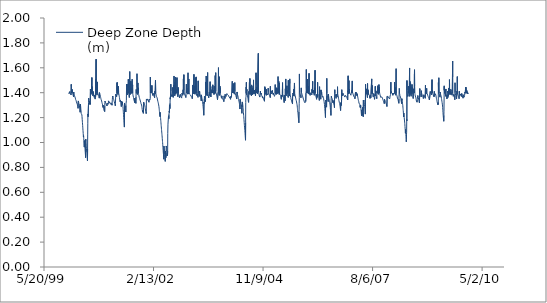
| Category | Deep Zone Depth (m) |
|---|---|
| 36526.0 | 1.4 |
| 36527.0 | 1.397 |
| 36528.0 | 1.395 |
| 36529.0 | 1.392 |
| 36530.0 | 1.391 |
| 36531.0 | 1.389 |
| 36532.0 | 1.387 |
| 36533.0 | 1.395 |
| 36534.0 | 1.393 |
| 36535.0 | 1.39 |
| 36536.0 | 1.409 |
| 36537.0 | 1.401 |
| 36538.0 | 1.398 |
| 36539.0 | 1.398 |
| 36540.0 | 1.395 |
| 36541.0 | 1.393 |
| 36542.0 | 1.391 |
| 36543.0 | 1.389 |
| 36544.0 | 1.386 |
| 36545.0 | 1.386 |
| 36546.0 | 1.384 |
| 36547.0 | 1.382 |
| 36548.0 | 1.38 |
| 36549.0 | 1.467 |
| 36550.0 | 1.449 |
| 36551.0 | 1.409 |
| 36552.0 | 1.408 |
| 36553.0 | 1.401 |
| 36554.0 | 1.417 |
| 36555.0 | 1.399 |
| 36556.0 | 1.428 |
| 36557.0 | 1.405 |
| 36558.0 | 1.4 |
| 36559.0 | 1.398 |
| 36560.0 | 1.395 |
| 36561.0 | 1.392 |
| 36562.0 | 1.39 |
| 36563.0 | 1.387 |
| 36564.0 | 1.384 |
| 36565.0 | 1.382 |
| 36566.0 | 1.379 |
| 36567.0 | 1.376 |
| 36568.0 | 1.373 |
| 36569.0 | 1.37 |
| 36570.0 | 1.367 |
| 36571.0 | 1.405 |
| 36572.0 | 1.399 |
| 36573.0 | 1.395 |
| 36574.0 | 1.392 |
| 36575.0 | 1.388 |
| 36576.0 | 1.385 |
| 36577.0 | 1.382 |
| 36578.0 | 1.379 |
| 36579.0 | 1.376 |
| 36580.0 | 1.373 |
| 36581.0 | 1.37 |
| 36582.0 | 1.366 |
| 36583.0 | 1.363 |
| 36584.0 | 1.364 |
| 36585.0 | 1.361 |
| 36586.0 | 1.357 |
| 36587.0 | 1.353 |
| 36588.0 | 1.349 |
| 36589.0 | 1.345 |
| 36590.0 | 1.352 |
| 36591.0 | 1.349 |
| 36592.0 | 1.344 |
| 36593.0 | 1.34 |
| 36594.0 | 1.335 |
| 36595.0 | 1.331 |
| 36596.0 | 1.327 |
| 36597.0 | 1.324 |
| 36598.0 | 1.324 |
| 36599.0 | 1.32 |
| 36600.0 | 1.316 |
| 36601.0 | 1.311 |
| 36602.0 | 1.313 |
| 36603.0 | 1.309 |
| 36604.0 | 1.307 |
| 36605.0 | 1.309 |
| 36606.0 | 1.308 |
| 36607.0 | 1.304 |
| 36608.0 | 1.299 |
| 36609.0 | 1.292 |
| 36610.0 | 1.284 |
| 36611.0 | 1.274 |
| 36612.0 | 1.322 |
| 36613.0 | 1.334 |
| 36614.0 | 1.332 |
| 36615.0 | 1.327 |
| 36616.0 | 1.324 |
| 36617.0 | 1.32 |
| 36618.0 | 1.316 |
| 36619.0 | 1.311 |
| 36620.0 | 1.307 |
| 36621.0 | 1.307 |
| 36622.0 | 1.302 |
| 36623.0 | 1.295 |
| 36624.0 | 1.284 |
| 36625.0 | 1.294 |
| 36626.0 | 1.286 |
| 36627.0 | 1.275 |
| 36628.0 | 1.264 |
| 36629.0 | 1.254 |
| 36630.0 | 1.243 |
| 36631.0 | 1.309 |
| 36632.0 | 1.308 |
| 36633.0 | 1.302 |
| 36634.0 | 1.295 |
| 36635.0 | 1.285 |
| 36636.0 | 1.274 |
| 36637.0 | 1.263 |
| 36638.0 | 1.253 |
| 36639.0 | 1.244 |
| 36640.0 | 1.233 |
| 36641.0 | 1.24 |
| 36642.0 | 1.231 |
| 36643.0 | 1.239 |
| 36644.0 | 1.228 |
| 36645.0 | 1.232 |
| 36646.0 | 1.222 |
| 36647.0 | 1.21 |
| 36648.0 | 1.197 |
| 36649.0 | 1.184 |
| 36650.0 | 1.172 |
| 36651.0 | 1.16 |
| 36652.0 | 1.148 |
| 36653.0 | 1.136 |
| 36654.0 | 1.123 |
| 36655.0 | 1.109 |
| 36656.0 | 1.096 |
| 36657.0 | 1.085 |
| 36658.0 | 1.072 |
| 36659.0 | 1.059 |
| 36660.0 | 1.046 |
| 36661.0 | 1.055 |
| 36662.0 | 1.042 |
| 36663.0 | 1.031 |
| 36664.0 | 1.017 |
| 36665.0 | 1.004 |
| 36666.0 | 0.989 |
| 36667.0 | 0.976 |
| 36668.0 | 0.963 |
| 36669.0 | 1.015 |
| 36670.0 | 1.003 |
| 36671.0 | 0.992 |
| 36672.0 | 0.98 |
| 36673.0 | 0.968 |
| 36674.0 | 0.954 |
| 36675.0 | 0.941 |
| 36676.0 | 0.93 |
| 36677.0 | 0.919 |
| 36678.0 | 0.907 |
| 36679.0 | 0.892 |
| 36680.0 | 0.878 |
| 36681.0 | 1.027 |
| 36682.0 | 1.013 |
| 36683.0 | 1 |
| 36684.0 | 0.99 |
| 36685.0 | 0.978 |
| 36686.0 | 0.965 |
| 36687.0 | 0.952 |
| 36688.0 | 0.939 |
| 36689.0 | 0.935 |
| 36690.0 | 0.933 |
| 36691.0 | 0.922 |
| 36692.0 | 0.911 |
| 36693.0 | 0.9 |
| 36694.0 | 0.888 |
| 36695.0 | 0.878 |
| 36696.0 | 0.867 |
| 36697.0 | 0.853 |
| 36698.0 | 0.948 |
| 36699.0 | 1.068 |
| 36700.0 | 1.155 |
| 36701.0 | 1.229 |
| 36702.0 | 1.219 |
| 36703.0 | 1.207 |
| 36704.0 | 1.199 |
| 36705.0 | 1.21 |
| 36706.0 | 1.3 |
| 36707.0 | 1.321 |
| 36708.0 | 1.356 |
| 36709.0 | 1.35 |
| 36710.0 | 1.344 |
| 36711.0 | 1.338 |
| 36712.0 | 1.332 |
| 36713.0 | 1.325 |
| 36714.0 | 1.318 |
| 36715.0 | 1.331 |
| 36716.0 | 1.325 |
| 36717.0 | 1.319 |
| 36718.0 | 1.312 |
| 36719.0 | 1.305 |
| 36720.0 | 1.316 |
| 36721.0 | 1.311 |
| 36722.0 | 1.307 |
| 36723.0 | 1.304 |
| 36724.0 | 1.429 |
| 36725.0 | 1.396 |
| 36726.0 | 1.39 |
| 36727.0 | 1.383 |
| 36728.0 | 1.391 |
| 36729.0 | 1.387 |
| 36730.0 | 1.419 |
| 36731.0 | 1.4 |
| 36732.0 | 1.398 |
| 36733.0 | 1.416 |
| 36734.0 | 1.396 |
| 36735.0 | 1.402 |
| 36736.0 | 1.397 |
| 36737.0 | 1.522 |
| 36738.0 | 1.395 |
| 36739.0 | 1.4 |
| 36740.0 | 1.449 |
| 36741.0 | 1.395 |
| 36742.0 | 1.399 |
| 36743.0 | 1.396 |
| 36744.0 | 1.39 |
| 36745.0 | 1.386 |
| 36746.0 | 1.38 |
| 36747.0 | 1.374 |
| 36748.0 | 1.394 |
| 36749.0 | 1.389 |
| 36750.0 | 1.384 |
| 36751.0 | 1.408 |
| 36752.0 | 1.397 |
| 36753.0 | 1.392 |
| 36754.0 | 1.385 |
| 36755.0 | 1.379 |
| 36756.0 | 1.373 |
| 36757.0 | 1.367 |
| 36758.0 | 1.368 |
| 36759.0 | 1.363 |
| 36760.0 | 1.358 |
| 36761.0 | 1.38 |
| 36762.0 | 1.374 |
| 36763.0 | 1.368 |
| 36764.0 | 1.366 |
| 36765.0 | 1.36 |
| 36766.0 | 1.354 |
| 36767.0 | 1.349 |
| 36768.0 | 1.378 |
| 36769.0 | 1.376 |
| 36770.0 | 1.37 |
| 36771.0 | 1.369 |
| 36772.0 | 1.508 |
| 36773.0 | 1.407 |
| 36774.0 | 1.4 |
| 36775.0 | 1.404 |
| 36776.0 | 1.669 |
| 36777.0 | 1.396 |
| 36778.0 | 1.404 |
| 36779.0 | 1.408 |
| 36780.0 | 1.399 |
| 36781.0 | 1.395 |
| 36782.0 | 1.39 |
| 36783.0 | 1.385 |
| 36784.0 | 1.38 |
| 36785.0 | 1.378 |
| 36786.0 | 1.383 |
| 36787.0 | 1.487 |
| 36788.0 | 1.398 |
| 36789.0 | 1.394 |
| 36790.0 | 1.4 |
| 36791.0 | 1.396 |
| 36792.0 | 1.394 |
| 36793.0 | 1.391 |
| 36794.0 | 1.388 |
| 36795.0 | 1.388 |
| 36796.0 | 1.385 |
| 36797.0 | 1.382 |
| 36798.0 | 1.378 |
| 36799.0 | 1.379 |
| 36800.0 | 1.375 |
| 36801.0 | 1.372 |
| 36802.0 | 1.368 |
| 36803.0 | 1.364 |
| 36804.0 | 1.36 |
| 36805.0 | 1.356 |
| 36806.0 | 1.401 |
| 36807.0 | 1.398 |
| 36808.0 | 1.395 |
| 36809.0 | 1.392 |
| 36810.0 | 1.389 |
| 36811.0 | 1.386 |
| 36812.0 | 1.382 |
| 36813.0 | 1.379 |
| 36814.0 | 1.375 |
| 36815.0 | 1.371 |
| 36816.0 | 1.367 |
| 36817.0 | 1.363 |
| 36818.0 | 1.359 |
| 36819.0 | 1.355 |
| 36820.0 | 1.352 |
| 36821.0 | 1.349 |
| 36822.0 | 1.345 |
| 36823.0 | 1.342 |
| 36824.0 | 1.341 |
| 36825.0 | 1.337 |
| 36826.0 | 1.334 |
| 36827.0 | 1.33 |
| 36828.0 | 1.326 |
| 36829.0 | 1.322 |
| 36830.0 | 1.319 |
| 36831.0 | 1.315 |
| 36832.0 | 1.312 |
| 36833.0 | 1.309 |
| 36834.0 | 1.306 |
| 36835.0 | 1.302 |
| 36836.0 | 1.299 |
| 36837.0 | 1.293 |
| 36838.0 | 1.287 |
| 36839.0 | 1.282 |
| 36840.0 | 1.299 |
| 36841.0 | 1.295 |
| 36842.0 | 1.29 |
| 36843.0 | 1.284 |
| 36844.0 | 1.278 |
| 36845.0 | 1.274 |
| 36846.0 | 1.269 |
| 36847.0 | 1.263 |
| 36848.0 | 1.258 |
| 36849.0 | 1.255 |
| 36850.0 | 1.263 |
| 36851.0 | 1.26 |
| 36852.0 | 1.257 |
| 36853.0 | 1.253 |
| 36854.0 | 1.248 |
| 36855.0 | 1.293 |
| 36856.0 | 1.323 |
| 36857.0 | 1.332 |
| 36858.0 | 1.33 |
| 36859.0 | 1.327 |
| 36860.0 | 1.325 |
| 36861.0 | 1.323 |
| 36862.0 | 1.32 |
| 36863.0 | 1.318 |
| 36864.0 | 1.316 |
| 36865.0 | 1.315 |
| 36866.0 | 1.313 |
| 36867.0 | 1.311 |
| 36868.0 | 1.309 |
| 36869.0 | 1.306 |
| 36870.0 | 1.304 |
| 36871.0 | 1.302 |
| 36872.0 | 1.304 |
| 36873.0 | 1.302 |
| 36874.0 | 1.298 |
| 36875.0 | 1.294 |
| 36876.0 | 1.289 |
| 36877.0 | 1.316 |
| 36878.0 | 1.319 |
| 36879.0 | 1.318 |
| 36880.0 | 1.319 |
| 36881.0 | 1.318 |
| 36882.0 | 1.316 |
| 36883.0 | 1.314 |
| 36884.0 | 1.312 |
| 36885.0 | 1.311 |
| 36886.0 | 1.309 |
| 36887.0 | 1.307 |
| 36888.0 | 1.305 |
| 36889.0 | 1.335 |
| 36890.0 | 1.333 |
| 36891.0 | 1.332 |
| 36892.0 | 1.331 |
| 36893.0 | 1.33 |
| 36894.0 | 1.328 |
| 36895.0 | 1.327 |
| 36896.0 | 1.325 |
| 36897.0 | 1.323 |
| 36898.0 | 1.321 |
| 36899.0 | 1.319 |
| 36900.0 | 1.319 |
| 36901.0 | 1.318 |
| 36902.0 | 1.316 |
| 36903.0 | 1.316 |
| 36904.0 | 1.321 |
| 36905.0 | 1.319 |
| 36906.0 | 1.317 |
| 36907.0 | 1.314 |
| 36908.0 | 1.311 |
| 36909.0 | 1.309 |
| 36910.0 | 1.307 |
| 36911.0 | 1.304 |
| 36912.0 | 1.319 |
| 36913.0 | 1.318 |
| 36914.0 | 1.316 |
| 36915.0 | 1.314 |
| 36916.0 | 1.312 |
| 36917.0 | 1.31 |
| 36918.0 | 1.308 |
| 36919.0 | 1.305 |
| 36920.0 | 1.302 |
| 36921.0 | 1.299 |
| 36922.0 | 1.314 |
| 36923.0 | 1.334 |
| 36924.0 | 1.343 |
| 36925.0 | 1.359 |
| 36926.0 | 1.357 |
| 36927.0 | 1.373 |
| 36928.0 | 1.371 |
| 36929.0 | 1.368 |
| 36930.0 | 1.365 |
| 36931.0 | 1.361 |
| 36932.0 | 1.358 |
| 36933.0 | 1.355 |
| 36934.0 | 1.352 |
| 36935.0 | 1.349 |
| 36936.0 | 1.346 |
| 36937.0 | 1.343 |
| 36938.0 | 1.34 |
| 36939.0 | 1.336 |
| 36940.0 | 1.333 |
| 36941.0 | 1.33 |
| 36942.0 | 1.327 |
| 36943.0 | 1.323 |
| 36944.0 | 1.319 |
| 36945.0 | 1.316 |
| 36946.0 | 1.314 |
| 36947.0 | 1.311 |
| 36948.0 | 1.308 |
| 36949.0 | 1.305 |
| 36950.0 | 1.301 |
| 36951.0 | 1.295 |
| 36952.0 | 1.312 |
| 36953.0 | 1.309 |
| 36954.0 | 1.306 |
| 36955.0 | 1.388 |
| 36956.0 | 1.385 |
| 36957.0 | 1.382 |
| 36958.0 | 1.379 |
| 36959.0 | 1.375 |
| 36960.0 | 1.38 |
| 36961.0 | 1.377 |
| 36962.0 | 1.373 |
| 36963.0 | 1.368 |
| 36964.0 | 1.385 |
| 36965.0 | 1.381 |
| 36966.0 | 1.481 |
| 36967.0 | 1.415 |
| 36968.0 | 1.398 |
| 36969.0 | 1.448 |
| 36970.0 | 1.482 |
| 36971.0 | 1.425 |
| 36972.0 | 1.398 |
| 36973.0 | 1.394 |
| 36974.0 | 1.39 |
| 36975.0 | 1.386 |
| 36976.0 | 1.413 |
| 36977.0 | 1.398 |
| 36978.0 | 1.395 |
| 36979.0 | 1.392 |
| 36980.0 | 1.451 |
| 36981.0 | 1.399 |
| 36982.0 | 1.395 |
| 36983.0 | 1.391 |
| 36984.0 | 1.386 |
| 36985.0 | 1.38 |
| 36986.0 | 1.376 |
| 36987.0 | 1.372 |
| 36988.0 | 1.366 |
| 36989.0 | 1.361 |
| 36990.0 | 1.355 |
| 36991.0 | 1.35 |
| 36992.0 | 1.345 |
| 36993.0 | 1.339 |
| 36994.0 | 1.333 |
| 36995.0 | 1.328 |
| 36996.0 | 1.33 |
| 36997.0 | 1.338 |
| 36998.0 | 1.334 |
| 36999.0 | 1.329 |
| 37000.0 | 1.326 |
| 37001.0 | 1.321 |
| 37002.0 | 1.316 |
| 37003.0 | 1.311 |
| 37004.0 | 1.305 |
| 37005.0 | 1.299 |
| 37006.0 | 1.288 |
| 37007.0 | 1.333 |
| 37008.0 | 1.329 |
| 37009.0 | 1.324 |
| 37010.0 | 1.318 |
| 37011.0 | 1.313 |
| 37012.0 | 1.309 |
| 37013.0 | 1.304 |
| 37014.0 | 1.327 |
| 37015.0 | 1.322 |
| 37016.0 | 1.317 |
| 37017.0 | 1.311 |
| 37018.0 | 1.305 |
| 37019.0 | 1.303 |
| 37020.0 | 1.297 |
| 37021.0 | 1.287 |
| 37022.0 | 1.276 |
| 37023.0 | 1.263 |
| 37024.0 | 1.252 |
| 37025.0 | 1.239 |
| 37026.0 | 1.226 |
| 37027.0 | 1.214 |
| 37028.0 | 1.2 |
| 37029.0 | 1.188 |
| 37030.0 | 1.175 |
| 37031.0 | 1.162 |
| 37032.0 | 1.151 |
| 37033.0 | 1.137 |
| 37034.0 | 1.124 |
| 37035.0 | 1.317 |
| 37036.0 | 1.31 |
| 37037.0 | 1.303 |
| 37038.0 | 1.293 |
| 37039.0 | 1.279 |
| 37040.0 | 1.275 |
| 37041.0 | 1.276 |
| 37042.0 | 1.293 |
| 37043.0 | 1.281 |
| 37044.0 | 1.282 |
| 37045.0 | 1.271 |
| 37046.0 | 1.258 |
| 37047.0 | 1.245 |
| 37048.0 | 1.299 |
| 37049.0 | 1.311 |
| 37050.0 | 1.306 |
| 37051.0 | 1.305 |
| 37052.0 | 1.336 |
| 37053.0 | 1.409 |
| 37054.0 | 1.443 |
| 37055.0 | 1.47 |
| 37056.0 | 1.395 |
| 37057.0 | 1.422 |
| 37058.0 | 1.394 |
| 37059.0 | 1.388 |
| 37060.0 | 1.381 |
| 37061.0 | 1.386 |
| 37062.0 | 1.379 |
| 37063.0 | 1.379 |
| 37064.0 | 1.376 |
| 37065.0 | 1.417 |
| 37066.0 | 1.469 |
| 37067.0 | 1.395 |
| 37068.0 | 1.389 |
| 37069.0 | 1.401 |
| 37070.0 | 1.507 |
| 37071.0 | 1.491 |
| 37072.0 | 1.433 |
| 37073.0 | 1.395 |
| 37074.0 | 1.39 |
| 37075.0 | 1.384 |
| 37076.0 | 1.378 |
| 37077.0 | 1.373 |
| 37078.0 | 1.367 |
| 37079.0 | 1.361 |
| 37080.0 | 1.355 |
| 37081.0 | 1.403 |
| 37082.0 | 1.396 |
| 37083.0 | 1.57 |
| 37084.0 | 1.428 |
| 37085.0 | 1.397 |
| 37086.0 | 1.437 |
| 37087.0 | 1.397 |
| 37088.0 | 1.392 |
| 37089.0 | 1.386 |
| 37090.0 | 1.396 |
| 37091.0 | 1.438 |
| 37092.0 | 1.395 |
| 37093.0 | 1.492 |
| 37094.0 | 1.396 |
| 37095.0 | 1.395 |
| 37096.0 | 1.402 |
| 37097.0 | 1.405 |
| 37098.0 | 1.398 |
| 37099.0 | 1.405 |
| 37100.0 | 1.414 |
| 37101.0 | 1.396 |
| 37102.0 | 1.436 |
| 37103.0 | 1.398 |
| 37104.0 | 1.472 |
| 37105.0 | 1.508 |
| 37106.0 | 1.399 |
| 37107.0 | 1.4 |
| 37108.0 | 1.396 |
| 37109.0 | 1.463 |
| 37110.0 | 1.395 |
| 37111.0 | 1.39 |
| 37112.0 | 1.385 |
| 37113.0 | 1.379 |
| 37114.0 | 1.374 |
| 37115.0 | 1.369 |
| 37116.0 | 1.368 |
| 37117.0 | 1.362 |
| 37118.0 | 1.359 |
| 37119.0 | 1.356 |
| 37120.0 | 1.35 |
| 37121.0 | 1.345 |
| 37122.0 | 1.339 |
| 37123.0 | 1.342 |
| 37124.0 | 1.337 |
| 37125.0 | 1.331 |
| 37126.0 | 1.326 |
| 37127.0 | 1.32 |
| 37128.0 | 1.314 |
| 37129.0 | 1.356 |
| 37130.0 | 1.351 |
| 37131.0 | 1.345 |
| 37132.0 | 1.339 |
| 37133.0 | 1.334 |
| 37134.0 | 1.328 |
| 37135.0 | 1.33 |
| 37136.0 | 1.325 |
| 37137.0 | 1.321 |
| 37138.0 | 1.318 |
| 37139.0 | 1.314 |
| 37140.0 | 1.367 |
| 37141.0 | 1.371 |
| 37142.0 | 1.427 |
| 37143.0 | 1.396 |
| 37144.0 | 1.392 |
| 37145.0 | 1.388 |
| 37146.0 | 1.395 |
| 37147.0 | 1.412 |
| 37148.0 | 1.426 |
| 37149.0 | 1.552 |
| 37150.0 | 1.444 |
| 37151.0 | 1.395 |
| 37152.0 | 1.391 |
| 37153.0 | 1.39 |
| 37154.0 | 1.386 |
| 37155.0 | 1.382 |
| 37156.0 | 1.379 |
| 37157.0 | 1.479 |
| 37158.0 | 1.397 |
| 37159.0 | 1.402 |
| 37160.0 | 1.439 |
| 37161.0 | 1.396 |
| 37162.0 | 1.393 |
| 37163.0 | 1.389 |
| 37164.0 | 1.385 |
| 37165.0 | 1.382 |
| 37166.0 | 1.378 |
| 37167.0 | 1.374 |
| 37168.0 | 1.37 |
| 37169.0 | 1.366 |
| 37170.0 | 1.362 |
| 37171.0 | 1.359 |
| 37172.0 | 1.357 |
| 37173.0 | 1.353 |
| 37174.0 | 1.35 |
| 37175.0 | 1.347 |
| 37176.0 | 1.346 |
| 37177.0 | 1.342 |
| 37178.0 | 1.339 |
| 37179.0 | 1.336 |
| 37180.0 | 1.333 |
| 37181.0 | 1.329 |
| 37182.0 | 1.326 |
| 37183.0 | 1.322 |
| 37184.0 | 1.319 |
| 37185.0 | 1.315 |
| 37186.0 | 1.312 |
| 37187.0 | 1.309 |
| 37188.0 | 1.306 |
| 37189.0 | 1.309 |
| 37190.0 | 1.305 |
| 37191.0 | 1.301 |
| 37192.0 | 1.297 |
| 37193.0 | 1.291 |
| 37194.0 | 1.285 |
| 37195.0 | 1.279 |
| 37196.0 | 1.272 |
| 37197.0 | 1.264 |
| 37198.0 | 1.259 |
| 37199.0 | 1.254 |
| 37200.0 | 1.25 |
| 37201.0 | 1.245 |
| 37202.0 | 1.24 |
| 37203.0 | 1.257 |
| 37204.0 | 1.251 |
| 37205.0 | 1.245 |
| 37206.0 | 1.24 |
| 37207.0 | 1.234 |
| 37208.0 | 1.228 |
| 37209.0 | 1.227 |
| 37210.0 | 1.323 |
| 37211.0 | 1.321 |
| 37212.0 | 1.319 |
| 37213.0 | 1.316 |
| 37214.0 | 1.313 |
| 37215.0 | 1.311 |
| 37216.0 | 1.308 |
| 37217.0 | 1.305 |
| 37218.0 | 1.303 |
| 37219.0 | 1.303 |
| 37220.0 | 1.3 |
| 37221.0 | 1.294 |
| 37222.0 | 1.288 |
| 37223.0 | 1.283 |
| 37224.0 | 1.277 |
| 37225.0 | 1.271 |
| 37226.0 | 1.266 |
| 37227.0 | 1.261 |
| 37228.0 | 1.256 |
| 37229.0 | 1.251 |
| 37230.0 | 1.247 |
| 37231.0 | 1.242 |
| 37232.0 | 1.237 |
| 37233.0 | 1.232 |
| 37234.0 | 1.248 |
| 37235.0 | 1.35 |
| 37236.0 | 1.353 |
| 37237.0 | 1.351 |
| 37238.0 | 1.349 |
| 37239.0 | 1.347 |
| 37240.0 | 1.345 |
| 37241.0 | 1.343 |
| 37242.0 | 1.341 |
| 37243.0 | 1.338 |
| 37244.0 | 1.35 |
| 37245.0 | 1.348 |
| 37246.0 | 1.346 |
| 37247.0 | 1.344 |
| 37248.0 | 1.342 |
| 37249.0 | 1.339 |
| 37250.0 | 1.337 |
| 37251.0 | 1.336 |
| 37252.0 | 1.335 |
| 37253.0 | 1.333 |
| 37254.0 | 1.331 |
| 37255.0 | 1.329 |
| 37256.0 | 1.327 |
| 37257.0 | 1.325 |
| 37258.0 | 1.323 |
| 37259.0 | 1.346 |
| 37260.0 | 1.345 |
| 37261.0 | 1.344 |
| 37262.0 | 1.342 |
| 37263.0 | 1.354 |
| 37264.0 | 1.353 |
| 37265.0 | 1.351 |
| 37266.0 | 1.349 |
| 37267.0 | 1.347 |
| 37268.0 | 1.344 |
| 37269.0 | 1.343 |
| 37270.0 | 1.355 |
| 37271.0 | 1.526 |
| 37272.0 | 1.398 |
| 37273.0 | 1.396 |
| 37274.0 | 1.393 |
| 37275.0 | 1.391 |
| 37276.0 | 1.393 |
| 37277.0 | 1.39 |
| 37278.0 | 1.419 |
| 37279.0 | 1.399 |
| 37280.0 | 1.396 |
| 37281.0 | 1.394 |
| 37282.0 | 1.437 |
| 37283.0 | 1.4 |
| 37284.0 | 1.398 |
| 37285.0 | 1.459 |
| 37286.0 | 1.398 |
| 37287.0 | 1.396 |
| 37288.0 | 1.394 |
| 37289.0 | 1.391 |
| 37290.0 | 1.388 |
| 37291.0 | 1.385 |
| 37292.0 | 1.383 |
| 37293.0 | 1.381 |
| 37294.0 | 1.378 |
| 37295.0 | 1.396 |
| 37296.0 | 1.393 |
| 37297.0 | 1.39 |
| 37298.0 | 1.388 |
| 37299.0 | 1.385 |
| 37300.0 | 1.382 |
| 37301.0 | 1.382 |
| 37302.0 | 1.379 |
| 37303.0 | 1.376 |
| 37304.0 | 1.374 |
| 37305.0 | 1.371 |
| 37306.0 | 1.368 |
| 37307.0 | 1.365 |
| 37308.0 | 1.362 |
| 37309.0 | 1.362 |
| 37310.0 | 1.36 |
| 37311.0 | 1.41 |
| 37312.0 | 1.4 |
| 37313.0 | 1.396 |
| 37314.0 | 1.393 |
| 37315.0 | 1.391 |
| 37316.0 | 1.389 |
| 37317.0 | 1.386 |
| 37318.0 | 1.499 |
| 37319.0 | 1.496 |
| 37320.0 | 1.398 |
| 37321.0 | 1.395 |
| 37322.0 | 1.391 |
| 37323.0 | 1.387 |
| 37324.0 | 1.383 |
| 37325.0 | 1.379 |
| 37326.0 | 1.375 |
| 37327.0 | 1.371 |
| 37328.0 | 1.377 |
| 37329.0 | 1.376 |
| 37330.0 | 1.373 |
| 37331.0 | 1.368 |
| 37332.0 | 1.363 |
| 37333.0 | 1.359 |
| 37334.0 | 1.354 |
| 37335.0 | 1.349 |
| 37336.0 | 1.345 |
| 37337.0 | 1.341 |
| 37338.0 | 1.338 |
| 37339.0 | 1.334 |
| 37340.0 | 1.329 |
| 37341.0 | 1.326 |
| 37342.0 | 1.322 |
| 37343.0 | 1.32 |
| 37344.0 | 1.315 |
| 37345.0 | 1.31 |
| 37346.0 | 1.306 |
| 37347.0 | 1.302 |
| 37348.0 | 1.3 |
| 37349.0 | 1.291 |
| 37350.0 | 1.285 |
| 37351.0 | 1.276 |
| 37352.0 | 1.267 |
| 37353.0 | 1.258 |
| 37354.0 | 1.248 |
| 37355.0 | 1.238 |
| 37356.0 | 1.228 |
| 37357.0 | 1.224 |
| 37358.0 | 1.216 |
| 37359.0 | 1.208 |
| 37360.0 | 1.242 |
| 37361.0 | 1.233 |
| 37362.0 | 1.223 |
| 37363.0 | 1.212 |
| 37364.0 | 1.201 |
| 37365.0 | 1.19 |
| 37366.0 | 1.178 |
| 37367.0 | 1.169 |
| 37368.0 | 1.158 |
| 37369.0 | 1.147 |
| 37370.0 | 1.137 |
| 37371.0 | 1.125 |
| 37372.0 | 1.116 |
| 37373.0 | 1.105 |
| 37374.0 | 1.094 |
| 37375.0 | 1.084 |
| 37376.0 | 1.074 |
| 37377.0 | 1.064 |
| 37378.0 | 1.054 |
| 37379.0 | 1.043 |
| 37380.0 | 1.032 |
| 37381.0 | 1.019 |
| 37382.0 | 1.009 |
| 37383.0 | 0.998 |
| 37384.0 | 0.985 |
| 37385.0 | 0.973 |
| 37386.0 | 0.96 |
| 37387.0 | 0.948 |
| 37388.0 | 0.936 |
| 37389.0 | 0.923 |
| 37390.0 | 0.913 |
| 37391.0 | 0.904 |
| 37392.0 | 0.892 |
| 37393.0 | 0.878 |
| 37394.0 | 0.866 |
| 37395.0 | 0.97 |
| 37396.0 | 0.969 |
| 37397.0 | 0.96 |
| 37398.0 | 0.95 |
| 37399.0 | 0.939 |
| 37400.0 | 0.929 |
| 37401.0 | 0.916 |
| 37402.0 | 0.904 |
| 37403.0 | 0.891 |
| 37404.0 | 0.88 |
| 37405.0 | 0.868 |
| 37406.0 | 0.857 |
| 37407.0 | 0.848 |
| 37408.0 | 0.932 |
| 37409.0 | 0.918 |
| 37410.0 | 0.906 |
| 37411.0 | 0.902 |
| 37412.0 | 0.89 |
| 37413.0 | 0.878 |
| 37414.0 | 0.916 |
| 37415.0 | 0.91 |
| 37416.0 | 0.972 |
| 37417.0 | 0.966 |
| 37418.0 | 0.962 |
| 37419.0 | 0.953 |
| 37420.0 | 0.941 |
| 37421.0 | 0.929 |
| 37422.0 | 0.916 |
| 37423.0 | 0.905 |
| 37424.0 | 0.892 |
| 37425.0 | 0.897 |
| 37426.0 | 0.896 |
| 37427.0 | 0.911 |
| 37428.0 | 0.902 |
| 37429.0 | 0.931 |
| 37430.0 | 1.071 |
| 37431.0 | 1.064 |
| 37432.0 | 1.147 |
| 37433.0 | 1.154 |
| 37434.0 | 1.15 |
| 37435.0 | 1.149 |
| 37436.0 | 1.203 |
| 37437.0 | 1.212 |
| 37438.0 | 1.205 |
| 37439.0 | 1.202 |
| 37440.0 | 1.191 |
| 37441.0 | 1.225 |
| 37442.0 | 1.22 |
| 37443.0 | 1.24 |
| 37444.0 | 1.253 |
| 37445.0 | 1.241 |
| 37446.0 | 1.302 |
| 37447.0 | 1.302 |
| 37448.0 | 1.293 |
| 37449.0 | 1.281 |
| 37450.0 | 1.272 |
| 37451.0 | 1.315 |
| 37452.0 | 1.36 |
| 37453.0 | 1.355 |
| 37454.0 | 1.349 |
| 37455.0 | 1.38 |
| 37456.0 | 1.375 |
| 37457.0 | 1.42 |
| 37458.0 | 1.469 |
| 37459.0 | 1.414 |
| 37460.0 | 1.396 |
| 37461.0 | 1.391 |
| 37462.0 | 1.386 |
| 37463.0 | 1.381 |
| 37464.0 | 1.378 |
| 37465.0 | 1.372 |
| 37466.0 | 1.371 |
| 37467.0 | 1.382 |
| 37468.0 | 1.376 |
| 37469.0 | 1.37 |
| 37470.0 | 1.388 |
| 37471.0 | 1.398 |
| 37472.0 | 1.442 |
| 37473.0 | 1.419 |
| 37474.0 | 1.395 |
| 37475.0 | 1.39 |
| 37476.0 | 1.384 |
| 37477.0 | 1.379 |
| 37478.0 | 1.373 |
| 37479.0 | 1.368 |
| 37480.0 | 1.362 |
| 37481.0 | 1.41 |
| 37482.0 | 1.404 |
| 37483.0 | 1.396 |
| 37484.0 | 1.459 |
| 37485.0 | 1.396 |
| 37486.0 | 1.427 |
| 37487.0 | 1.534 |
| 37488.0 | 1.396 |
| 37489.0 | 1.392 |
| 37490.0 | 1.398 |
| 37491.0 | 1.392 |
| 37492.0 | 1.386 |
| 37493.0 | 1.38 |
| 37494.0 | 1.375 |
| 37495.0 | 1.373 |
| 37496.0 | 1.485 |
| 37497.0 | 1.396 |
| 37498.0 | 1.457 |
| 37499.0 | 1.526 |
| 37500.0 | 1.396 |
| 37501.0 | 1.392 |
| 37502.0 | 1.388 |
| 37503.0 | 1.383 |
| 37504.0 | 1.384 |
| 37505.0 | 1.424 |
| 37506.0 | 1.396 |
| 37507.0 | 1.391 |
| 37508.0 | 1.402 |
| 37509.0 | 1.397 |
| 37510.0 | 1.392 |
| 37511.0 | 1.388 |
| 37512.0 | 1.425 |
| 37513.0 | 1.398 |
| 37514.0 | 1.521 |
| 37515.0 | 1.399 |
| 37516.0 | 1.395 |
| 37517.0 | 1.39 |
| 37518.0 | 1.385 |
| 37519.0 | 1.381 |
| 37520.0 | 1.376 |
| 37521.0 | 1.373 |
| 37522.0 | 1.368 |
| 37523.0 | 1.363 |
| 37524.0 | 1.443 |
| 37525.0 | 1.401 |
| 37526.0 | 1.431 |
| 37527.0 | 1.396 |
| 37528.0 | 1.391 |
| 37529.0 | 1.386 |
| 37530.0 | 1.382 |
| 37531.0 | 1.384 |
| 37532.0 | 1.379 |
| 37533.0 | 1.375 |
| 37534.0 | 1.371 |
| 37535.0 | 1.367 |
| 37536.0 | 1.363 |
| 37537.0 | 1.359 |
| 37538.0 | 1.364 |
| 37539.0 | 1.362 |
| 37540.0 | 1.361 |
| 37541.0 | 1.358 |
| 37542.0 | 1.354 |
| 37543.0 | 1.351 |
| 37544.0 | 1.354 |
| 37545.0 | 1.386 |
| 37546.0 | 1.383 |
| 37547.0 | 1.38 |
| 37548.0 | 1.377 |
| 37549.0 | 1.373 |
| 37550.0 | 1.369 |
| 37551.0 | 1.365 |
| 37552.0 | 1.361 |
| 37553.0 | 1.358 |
| 37554.0 | 1.365 |
| 37555.0 | 1.363 |
| 37556.0 | 1.36 |
| 37557.0 | 1.357 |
| 37558.0 | 1.353 |
| 37559.0 | 1.352 |
| 37560.0 | 1.396 |
| 37561.0 | 1.394 |
| 37562.0 | 1.39 |
| 37563.0 | 1.388 |
| 37564.0 | 1.385 |
| 37565.0 | 1.382 |
| 37566.0 | 1.379 |
| 37567.0 | 1.396 |
| 37568.0 | 1.394 |
| 37569.0 | 1.391 |
| 37570.0 | 1.388 |
| 37571.0 | 1.423 |
| 37572.0 | 1.398 |
| 37573.0 | 1.511 |
| 37574.0 | 1.425 |
| 37575.0 | 1.397 |
| 37576.0 | 1.395 |
| 37577.0 | 1.545 |
| 37578.0 | 1.417 |
| 37579.0 | 1.398 |
| 37580.0 | 1.395 |
| 37581.0 | 1.393 |
| 37582.0 | 1.391 |
| 37583.0 | 1.389 |
| 37584.0 | 1.387 |
| 37585.0 | 1.385 |
| 37586.0 | 1.382 |
| 37587.0 | 1.38 |
| 37588.0 | 1.377 |
| 37589.0 | 1.375 |
| 37590.0 | 1.373 |
| 37591.0 | 1.371 |
| 37592.0 | 1.368 |
| 37593.0 | 1.366 |
| 37594.0 | 1.364 |
| 37595.0 | 1.361 |
| 37596.0 | 1.386 |
| 37597.0 | 1.406 |
| 37598.0 | 1.401 |
| 37599.0 | 1.399 |
| 37600.0 | 1.469 |
| 37601.0 | 1.427 |
| 37602.0 | 1.398 |
| 37603.0 | 1.416 |
| 37604.0 | 1.437 |
| 37605.0 | 1.399 |
| 37606.0 | 1.397 |
| 37607.0 | 1.395 |
| 37608.0 | 1.393 |
| 37609.0 | 1.391 |
| 37610.0 | 1.389 |
| 37611.0 | 1.4 |
| 37612.0 | 1.398 |
| 37613.0 | 1.396 |
| 37614.0 | 1.393 |
| 37615.0 | 1.56 |
| 37616.0 | 1.398 |
| 37617.0 | 1.397 |
| 37618.0 | 1.395 |
| 37619.0 | 1.393 |
| 37620.0 | 1.391 |
| 37621.0 | 1.389 |
| 37622.0 | 1.51 |
| 37623.0 | 1.398 |
| 37624.0 | 1.396 |
| 37625.0 | 1.395 |
| 37626.0 | 1.394 |
| 37627.0 | 1.392 |
| 37628.0 | 1.389 |
| 37629.0 | 1.388 |
| 37630.0 | 1.386 |
| 37631.0 | 1.384 |
| 37632.0 | 1.386 |
| 37633.0 | 1.384 |
| 37634.0 | 1.384 |
| 37635.0 | 1.387 |
| 37636.0 | 1.386 |
| 37637.0 | 1.384 |
| 37638.0 | 1.381 |
| 37639.0 | 1.379 |
| 37640.0 | 1.378 |
| 37641.0 | 1.377 |
| 37642.0 | 1.374 |
| 37643.0 | 1.372 |
| 37644.0 | 1.372 |
| 37645.0 | 1.371 |
| 37646.0 | 1.37 |
| 37647.0 | 1.368 |
| 37648.0 | 1.366 |
| 37649.0 | 1.364 |
| 37650.0 | 1.362 |
| 37651.0 | 1.359 |
| 37652.0 | 1.357 |
| 37653.0 | 1.354 |
| 37654.0 | 1.352 |
| 37655.0 | 1.349 |
| 37656.0 | 1.346 |
| 37657.0 | 1.356 |
| 37658.0 | 1.354 |
| 37659.0 | 1.359 |
| 37660.0 | 1.462 |
| 37661.0 | 1.4 |
| 37662.0 | 1.439 |
| 37663.0 | 1.412 |
| 37664.0 | 1.399 |
| 37665.0 | 1.397 |
| 37666.0 | 1.394 |
| 37667.0 | 1.391 |
| 37668.0 | 1.387 |
| 37669.0 | 1.547 |
| 37670.0 | 1.399 |
| 37671.0 | 1.396 |
| 37672.0 | 1.393 |
| 37673.0 | 1.39 |
| 37674.0 | 1.387 |
| 37675.0 | 1.454 |
| 37676.0 | 1.397 |
| 37677.0 | 1.394 |
| 37678.0 | 1.391 |
| 37679.0 | 1.387 |
| 37680.0 | 1.432 |
| 37681.0 | 1.417 |
| 37682.0 | 1.52 |
| 37683.0 | 1.398 |
| 37684.0 | 1.42 |
| 37685.0 | 1.457 |
| 37686.0 | 1.396 |
| 37687.0 | 1.393 |
| 37688.0 | 1.41 |
| 37689.0 | 1.4 |
| 37690.0 | 1.527 |
| 37691.0 | 1.397 |
| 37692.0 | 1.392 |
| 37693.0 | 1.388 |
| 37694.0 | 1.384 |
| 37695.0 | 1.38 |
| 37696.0 | 1.377 |
| 37697.0 | 1.374 |
| 37698.0 | 1.391 |
| 37699.0 | 1.387 |
| 37700.0 | 1.383 |
| 37701.0 | 1.38 |
| 37702.0 | 1.375 |
| 37703.0 | 1.371 |
| 37704.0 | 1.371 |
| 37705.0 | 1.367 |
| 37706.0 | 1.363 |
| 37707.0 | 1.359 |
| 37708.0 | 1.495 |
| 37709.0 | 1.397 |
| 37710.0 | 1.393 |
| 37711.0 | 1.412 |
| 37712.0 | 1.4 |
| 37713.0 | 1.395 |
| 37714.0 | 1.391 |
| 37715.0 | 1.386 |
| 37716.0 | 1.381 |
| 37717.0 | 1.376 |
| 37718.0 | 1.37 |
| 37719.0 | 1.366 |
| 37720.0 | 1.414 |
| 37721.0 | 1.408 |
| 37722.0 | 1.401 |
| 37723.0 | 1.397 |
| 37724.0 | 1.393 |
| 37725.0 | 1.387 |
| 37726.0 | 1.382 |
| 37727.0 | 1.377 |
| 37728.0 | 1.372 |
| 37729.0 | 1.367 |
| 37730.0 | 1.362 |
| 37731.0 | 1.357 |
| 37732.0 | 1.353 |
| 37733.0 | 1.348 |
| 37734.0 | 1.344 |
| 37735.0 | 1.339 |
| 37736.0 | 1.334 |
| 37737.0 | 1.382 |
| 37738.0 | 1.378 |
| 37739.0 | 1.373 |
| 37740.0 | 1.368 |
| 37741.0 | 1.363 |
| 37742.0 | 1.358 |
| 37743.0 | 1.353 |
| 37744.0 | 1.347 |
| 37745.0 | 1.342 |
| 37746.0 | 1.336 |
| 37747.0 | 1.329 |
| 37748.0 | 1.324 |
| 37749.0 | 1.318 |
| 37750.0 | 1.312 |
| 37751.0 | 1.306 |
| 37752.0 | 1.299 |
| 37753.0 | 1.288 |
| 37754.0 | 1.28 |
| 37755.0 | 1.268 |
| 37756.0 | 1.256 |
| 37757.0 | 1.244 |
| 37758.0 | 1.232 |
| 37759.0 | 1.219 |
| 37760.0 | 1.211 |
| 37761.0 | 1.324 |
| 37762.0 | 1.32 |
| 37763.0 | 1.315 |
| 37764.0 | 1.35 |
| 37765.0 | 1.371 |
| 37766.0 | 1.367 |
| 37767.0 | 1.361 |
| 37768.0 | 1.356 |
| 37769.0 | 1.35 |
| 37770.0 | 1.344 |
| 37771.0 | 1.338 |
| 37772.0 | 1.333 |
| 37773.0 | 1.328 |
| 37774.0 | 1.325 |
| 37775.0 | 1.344 |
| 37776.0 | 1.486 |
| 37777.0 | 1.479 |
| 37778.0 | 1.42 |
| 37779.0 | 1.395 |
| 37780.0 | 1.409 |
| 37781.0 | 1.534 |
| 37782.0 | 1.394 |
| 37783.0 | 1.39 |
| 37784.0 | 1.384 |
| 37785.0 | 1.417 |
| 37786.0 | 1.395 |
| 37787.0 | 1.39 |
| 37788.0 | 1.384 |
| 37789.0 | 1.379 |
| 37790.0 | 1.374 |
| 37791.0 | 1.414 |
| 37792.0 | 1.444 |
| 37793.0 | 1.485 |
| 37794.0 | 1.562 |
| 37795.0 | 1.403 |
| 37796.0 | 1.396 |
| 37797.0 | 1.39 |
| 37798.0 | 1.385 |
| 37799.0 | 1.378 |
| 37800.0 | 1.372 |
| 37801.0 | 1.371 |
| 37802.0 | 1.368 |
| 37803.0 | 1.364 |
| 37804.0 | 1.359 |
| 37805.0 | 1.373 |
| 37806.0 | 1.377 |
| 37807.0 | 1.372 |
| 37808.0 | 1.367 |
| 37809.0 | 1.405 |
| 37810.0 | 1.397 |
| 37811.0 | 1.391 |
| 37812.0 | 1.385 |
| 37813.0 | 1.382 |
| 37814.0 | 1.379 |
| 37815.0 | 1.375 |
| 37816.0 | 1.375 |
| 37817.0 | 1.488 |
| 37818.0 | 1.396 |
| 37819.0 | 1.392 |
| 37820.0 | 1.387 |
| 37821.0 | 1.381 |
| 37822.0 | 1.375 |
| 37823.0 | 1.37 |
| 37824.0 | 1.366 |
| 37825.0 | 1.394 |
| 37826.0 | 1.391 |
| 37827.0 | 1.424 |
| 37828.0 | 1.413 |
| 37829.0 | 1.396 |
| 37830.0 | 1.411 |
| 37831.0 | 1.409 |
| 37832.0 | 1.397 |
| 37833.0 | 1.394 |
| 37834.0 | 1.406 |
| 37835.0 | 1.424 |
| 37836.0 | 1.45 |
| 37837.0 | 1.444 |
| 37838.0 | 1.398 |
| 37839.0 | 1.407 |
| 37840.0 | 1.398 |
| 37841.0 | 1.463 |
| 37842.0 | 1.427 |
| 37843.0 | 1.397 |
| 37844.0 | 1.392 |
| 37845.0 | 1.394 |
| 37846.0 | 1.417 |
| 37847.0 | 1.398 |
| 37848.0 | 1.399 |
| 37849.0 | 1.421 |
| 37850.0 | 1.395 |
| 37851.0 | 1.39 |
| 37852.0 | 1.385 |
| 37853.0 | 1.381 |
| 37854.0 | 1.38 |
| 37855.0 | 1.453 |
| 37856.0 | 1.401 |
| 37857.0 | 1.397 |
| 37858.0 | 1.392 |
| 37859.0 | 1.386 |
| 37860.0 | 1.388 |
| 37861.0 | 1.385 |
| 37862.0 | 1.404 |
| 37863.0 | 1.538 |
| 37864.0 | 1.396 |
| 37865.0 | 1.391 |
| 37866.0 | 1.424 |
| 37867.0 | 1.465 |
| 37868.0 | 1.561 |
| 37869.0 | 1.413 |
| 37870.0 | 1.4 |
| 37871.0 | 1.399 |
| 37872.0 | 1.397 |
| 37873.0 | 1.393 |
| 37874.0 | 1.389 |
| 37875.0 | 1.384 |
| 37876.0 | 1.38 |
| 37877.0 | 1.376 |
| 37878.0 | 1.371 |
| 37879.0 | 1.367 |
| 37880.0 | 1.362 |
| 37881.0 | 1.358 |
| 37882.0 | 1.353 |
| 37883.0 | 1.349 |
| 37884.0 | 1.344 |
| 37885.0 | 1.339 |
| 37886.0 | 1.349 |
| 37887.0 | 1.345 |
| 37888.0 | 1.346 |
| 37889.0 | 1.344 |
| 37890.0 | 1.404 |
| 37891.0 | 1.403 |
| 37892.0 | 1.398 |
| 37893.0 | 1.602 |
| 37894.0 | 1.397 |
| 37895.0 | 1.394 |
| 37896.0 | 1.395 |
| 37897.0 | 1.392 |
| 37898.0 | 1.389 |
| 37899.0 | 1.385 |
| 37900.0 | 1.382 |
| 37901.0 | 1.378 |
| 37902.0 | 1.528 |
| 37903.0 | 1.397 |
| 37904.0 | 1.394 |
| 37905.0 | 1.392 |
| 37906.0 | 1.453 |
| 37907.0 | 1.401 |
| 37908.0 | 1.44 |
| 37909.0 | 1.397 |
| 37910.0 | 1.394 |
| 37911.0 | 1.39 |
| 37912.0 | 1.387 |
| 37913.0 | 1.384 |
| 37914.0 | 1.381 |
| 37915.0 | 1.377 |
| 37916.0 | 1.373 |
| 37917.0 | 1.37 |
| 37918.0 | 1.366 |
| 37919.0 | 1.362 |
| 37920.0 | 1.358 |
| 37921.0 | 1.356 |
| 37922.0 | 1.353 |
| 37923.0 | 1.374 |
| 37924.0 | 1.371 |
| 37925.0 | 1.367 |
| 37926.0 | 1.364 |
| 37927.0 | 1.361 |
| 37928.0 | 1.358 |
| 37929.0 | 1.355 |
| 37930.0 | 1.352 |
| 37931.0 | 1.353 |
| 37932.0 | 1.352 |
| 37933.0 | 1.349 |
| 37934.0 | 1.346 |
| 37935.0 | 1.344 |
| 37936.0 | 1.342 |
| 37937.0 | 1.342 |
| 37938.0 | 1.34 |
| 37939.0 | 1.337 |
| 37940.0 | 1.334 |
| 37941.0 | 1.331 |
| 37942.0 | 1.328 |
| 37943.0 | 1.325 |
| 37944.0 | 1.322 |
| 37945.0 | 1.374 |
| 37946.0 | 1.372 |
| 37947.0 | 1.369 |
| 37948.0 | 1.366 |
| 37949.0 | 1.363 |
| 37950.0 | 1.361 |
| 37951.0 | 1.36 |
| 37952.0 | 1.357 |
| 37953.0 | 1.354 |
| 37954.0 | 1.386 |
| 37955.0 | 1.385 |
| 37956.0 | 1.382 |
| 37957.0 | 1.38 |
| 37958.0 | 1.378 |
| 37959.0 | 1.376 |
| 37960.0 | 1.374 |
| 37961.0 | 1.372 |
| 37962.0 | 1.371 |
| 37963.0 | 1.37 |
| 37964.0 | 1.368 |
| 37965.0 | 1.365 |
| 37966.0 | 1.38 |
| 37967.0 | 1.378 |
| 37968.0 | 1.376 |
| 37969.0 | 1.374 |
| 37970.0 | 1.393 |
| 37971.0 | 1.391 |
| 37972.0 | 1.391 |
| 37973.0 | 1.39 |
| 37974.0 | 1.388 |
| 37975.0 | 1.386 |
| 37976.0 | 1.385 |
| 37977.0 | 1.383 |
| 37978.0 | 1.381 |
| 37979.0 | 1.379 |
| 37980.0 | 1.387 |
| 37981.0 | 1.385 |
| 37982.0 | 1.384 |
| 37983.0 | 1.381 |
| 37984.0 | 1.379 |
| 37985.0 | 1.377 |
| 37986.0 | 1.375 |
| 37987.0 | 1.373 |
| 37988.0 | 1.371 |
| 37989.0 | 1.368 |
| 37990.0 | 1.365 |
| 37991.0 | 1.363 |
| 37992.0 | 1.36 |
| 37993.0 | 1.361 |
| 37994.0 | 1.36 |
| 37995.0 | 1.357 |
| 37996.0 | 1.36 |
| 37997.0 | 1.359 |
| 37998.0 | 1.358 |
| 37999.0 | 1.356 |
| 38000.0 | 1.353 |
| 38001.0 | 1.351 |
| 38002.0 | 1.349 |
| 38003.0 | 1.347 |
| 38004.0 | 1.345 |
| 38005.0 | 1.37 |
| 38006.0 | 1.372 |
| 38007.0 | 1.371 |
| 38008.0 | 1.369 |
| 38009.0 | 1.367 |
| 38010.0 | 1.365 |
| 38011.0 | 1.362 |
| 38012.0 | 1.359 |
| 38013.0 | 1.398 |
| 38014.0 | 1.398 |
| 38015.0 | 1.396 |
| 38016.0 | 1.394 |
| 38017.0 | 1.392 |
| 38018.0 | 1.402 |
| 38019.0 | 1.492 |
| 38020.0 | 1.418 |
| 38021.0 | 1.398 |
| 38022.0 | 1.396 |
| 38023.0 | 1.393 |
| 38024.0 | 1.437 |
| 38025.0 | 1.417 |
| 38026.0 | 1.398 |
| 38027.0 | 1.396 |
| 38028.0 | 1.404 |
| 38029.0 | 1.404 |
| 38030.0 | 1.399 |
| 38031.0 | 1.401 |
| 38032.0 | 1.473 |
| 38033.0 | 1.397 |
| 38034.0 | 1.395 |
| 38035.0 | 1.396 |
| 38036.0 | 1.394 |
| 38037.0 | 1.391 |
| 38038.0 | 1.388 |
| 38039.0 | 1.385 |
| 38040.0 | 1.382 |
| 38041.0 | 1.411 |
| 38042.0 | 1.481 |
| 38043.0 | 1.411 |
| 38044.0 | 1.404 |
| 38045.0 | 1.401 |
| 38046.0 | 1.398 |
| 38047.0 | 1.395 |
| 38048.0 | 1.391 |
| 38049.0 | 1.387 |
| 38050.0 | 1.383 |
| 38051.0 | 1.379 |
| 38052.0 | 1.375 |
| 38053.0 | 1.372 |
| 38054.0 | 1.368 |
| 38055.0 | 1.364 |
| 38056.0 | 1.364 |
| 38057.0 | 1.361 |
| 38058.0 | 1.357 |
| 38059.0 | 1.353 |
| 38060.0 | 1.349 |
| 38061.0 | 1.345 |
| 38062.0 | 1.346 |
| 38063.0 | 1.406 |
| 38064.0 | 1.399 |
| 38065.0 | 1.394 |
| 38066.0 | 1.389 |
| 38067.0 | 1.385 |
| 38068.0 | 1.381 |
| 38069.0 | 1.377 |
| 38070.0 | 1.374 |
| 38071.0 | 1.37 |
| 38072.0 | 1.367 |
| 38073.0 | 1.363 |
| 38074.0 | 1.359 |
| 38075.0 | 1.355 |
| 38076.0 | 1.35 |
| 38077.0 | 1.345 |
| 38078.0 | 1.341 |
| 38079.0 | 1.337 |
| 38080.0 | 1.333 |
| 38081.0 | 1.328 |
| 38082.0 | 1.324 |
| 38083.0 | 1.319 |
| 38084.0 | 1.314 |
| 38085.0 | 1.309 |
| 38086.0 | 1.305 |
| 38087.0 | 1.293 |
| 38088.0 | 1.279 |
| 38089.0 | 1.269 |
| 38090.0 | 1.268 |
| 38091.0 | 1.346 |
| 38092.0 | 1.343 |
| 38093.0 | 1.338 |
| 38094.0 | 1.333 |
| 38095.0 | 1.328 |
| 38096.0 | 1.322 |
| 38097.0 | 1.317 |
| 38098.0 | 1.311 |
| 38099.0 | 1.306 |
| 38100.0 | 1.301 |
| 38101.0 | 1.291 |
| 38102.0 | 1.28 |
| 38103.0 | 1.269 |
| 38104.0 | 1.266 |
| 38105.0 | 1.256 |
| 38106.0 | 1.245 |
| 38107.0 | 1.234 |
| 38108.0 | 1.303 |
| 38109.0 | 1.294 |
| 38110.0 | 1.285 |
| 38111.0 | 1.326 |
| 38112.0 | 1.321 |
| 38113.0 | 1.315 |
| 38114.0 | 1.308 |
| 38115.0 | 1.302 |
| 38116.0 | 1.293 |
| 38117.0 | 1.281 |
| 38118.0 | 1.269 |
| 38119.0 | 1.26 |
| 38120.0 | 1.249 |
| 38121.0 | 1.24 |
| 38122.0 | 1.229 |
| 38123.0 | 1.218 |
| 38124.0 | 1.207 |
| 38125.0 | 1.196 |
| 38126.0 | 1.185 |
| 38127.0 | 1.173 |
| 38128.0 | 1.161 |
| 38129.0 | 1.148 |
| 38130.0 | 1.135 |
| 38131.0 | 1.123 |
| 38132.0 | 1.122 |
| 38133.0 | 1.108 |
| 38134.0 | 1.095 |
| 38135.0 | 1.083 |
| 38136.0 | 1.07 |
| 38137.0 | 1.057 |
| 38138.0 | 1.043 |
| 38139.0 | 1.031 |
| 38140.0 | 1.018 |
| 38141.0 | 1.161 |
| 38142.0 | 1.321 |
| 38143.0 | 1.363 |
| 38144.0 | 1.357 |
| 38145.0 | 1.372 |
| 38146.0 | 1.445 |
| 38147.0 | 1.395 |
| 38148.0 | 1.483 |
| 38149.0 | 1.395 |
| 38150.0 | 1.389 |
| 38151.0 | 1.382 |
| 38152.0 | 1.428 |
| 38153.0 | 1.413 |
| 38154.0 | 1.397 |
| 38155.0 | 1.392 |
| 38156.0 | 1.386 |
| 38157.0 | 1.38 |
| 38158.0 | 1.374 |
| 38159.0 | 1.37 |
| 38160.0 | 1.365 |
| 38161.0 | 1.36 |
| 38162.0 | 1.355 |
| 38163.0 | 1.349 |
| 38164.0 | 1.343 |
| 38165.0 | 1.337 |
| 38166.0 | 1.331 |
| 38167.0 | 1.327 |
| 38168.0 | 1.322 |
| 38169.0 | 1.316 |
| 38170.0 | 1.409 |
| 38171.0 | 1.396 |
| 38172.0 | 1.4 |
| 38173.0 | 1.394 |
| 38174.0 | 1.388 |
| 38175.0 | 1.382 |
| 38176.0 | 1.484 |
| 38177.0 | 1.405 |
| 38178.0 | 1.397 |
| 38179.0 | 1.39 |
| 38180.0 | 1.514 |
| 38181.0 | 1.396 |
| 38182.0 | 1.39 |
| 38183.0 | 1.385 |
| 38184.0 | 1.401 |
| 38185.0 | 1.421 |
| 38186.0 | 1.419 |
| 38187.0 | 1.45 |
| 38188.0 | 1.435 |
| 38189.0 | 1.436 |
| 38190.0 | 1.394 |
| 38191.0 | 1.388 |
| 38192.0 | 1.382 |
| 38193.0 | 1.379 |
| 38194.0 | 1.374 |
| 38195.0 | 1.402 |
| 38196.0 | 1.463 |
| 38197.0 | 1.443 |
| 38198.0 | 1.395 |
| 38199.0 | 1.389 |
| 38200.0 | 1.384 |
| 38201.0 | 1.382 |
| 38202.0 | 1.437 |
| 38203.0 | 1.395 |
| 38204.0 | 1.39 |
| 38205.0 | 1.385 |
| 38206.0 | 1.408 |
| 38207.0 | 1.399 |
| 38208.0 | 1.395 |
| 38209.0 | 1.391 |
| 38210.0 | 1.452 |
| 38211.0 | 1.397 |
| 38212.0 | 1.429 |
| 38213.0 | 1.503 |
| 38214.0 | 1.399 |
| 38215.0 | 1.395 |
| 38216.0 | 1.39 |
| 38217.0 | 1.416 |
| 38218.0 | 1.418 |
| 38219.0 | 1.395 |
| 38220.0 | 1.389 |
| 38221.0 | 1.421 |
| 38222.0 | 1.405 |
| 38223.0 | 1.408 |
| 38224.0 | 1.398 |
| 38225.0 | 1.394 |
| 38226.0 | 1.398 |
| 38227.0 | 1.394 |
| 38228.0 | 1.389 |
| 38229.0 | 1.384 |
| 38230.0 | 1.379 |
| 38231.0 | 1.375 |
| 38232.0 | 1.372 |
| 38233.0 | 1.428 |
| 38234.0 | 1.411 |
| 38235.0 | 1.401 |
| 38236.0 | 1.56 |
| 38237.0 | 1.555 |
| 38238.0 | 1.464 |
| 38239.0 | 1.397 |
| 38240.0 | 1.444 |
| 38241.0 | 1.41 |
| 38242.0 | 1.4 |
| 38243.0 | 1.415 |
| 38244.0 | 1.414 |
| 38245.0 | 1.399 |
| 38246.0 | 1.397 |
| 38247.0 | 1.395 |
| 38248.0 | 1.393 |
| 38249.0 | 1.391 |
| 38250.0 | 1.389 |
| 38251.0 | 1.388 |
| 38252.0 | 1.399 |
| 38253.0 | 1.396 |
| 38254.0 | 1.392 |
| 38255.0 | 1.387 |
| 38256.0 | 1.388 |
| 38257.0 | 1.716 |
| 38258.0 | 1.403 |
| 38259.0 | 1.399 |
| 38260.0 | 1.395 |
| 38261.0 | 1.39 |
| 38262.0 | 1.387 |
| 38263.0 | 1.384 |
| 38264.0 | 1.38 |
| 38265.0 | 1.378 |
| 38266.0 | 1.374 |
| 38267.0 | 1.371 |
| 38268.0 | 1.371 |
| 38269.0 | 1.368 |
| 38270.0 | 1.365 |
| 38271.0 | 1.362 |
| 38272.0 | 1.378 |
| 38273.0 | 1.375 |
| 38274.0 | 1.371 |
| 38275.0 | 1.373 |
| 38276.0 | 1.413 |
| 38277.0 | 1.398 |
| 38278.0 | 1.394 |
| 38279.0 | 1.39 |
| 38280.0 | 1.387 |
| 38281.0 | 1.397 |
| 38282.0 | 1.394 |
| 38283.0 | 1.392 |
| 38284.0 | 1.389 |
| 38285.0 | 1.385 |
| 38286.0 | 1.382 |
| 38287.0 | 1.379 |
| 38288.0 | 1.375 |
| 38289.0 | 1.372 |
| 38290.0 | 1.375 |
| 38291.0 | 1.371 |
| 38292.0 | 1.368 |
| 38293.0 | 1.365 |
| 38294.0 | 1.362 |
| 38295.0 | 1.359 |
| 38296.0 | 1.368 |
| 38297.0 | 1.366 |
| 38298.0 | 1.363 |
| 38299.0 | 1.36 |
| 38300.0 | 1.358 |
| 38301.0 | 1.355 |
| 38302.0 | 1.353 |
| 38303.0 | 1.35 |
| 38304.0 | 1.35 |
| 38305.0 | 1.348 |
| 38306.0 | 1.347 |
| 38307.0 | 1.345 |
| 38308.0 | 1.342 |
| 38309.0 | 1.34 |
| 38310.0 | 1.337 |
| 38311.0 | 1.334 |
| 38312.0 | 1.334 |
| 38313.0 | 1.331 |
| 38314.0 | 1.329 |
| 38315.0 | 1.326 |
| 38316.0 | 1.448 |
| 38317.0 | 1.404 |
| 38318.0 | 1.4 |
| 38319.0 | 1.438 |
| 38320.0 | 1.398 |
| 38321.0 | 1.395 |
| 38322.0 | 1.393 |
| 38323.0 | 1.391 |
| 38324.0 | 1.389 |
| 38325.0 | 1.387 |
| 38326.0 | 1.388 |
| 38327.0 | 1.386 |
| 38328.0 | 1.383 |
| 38329.0 | 1.381 |
| 38330.0 | 1.379 |
| 38331.0 | 1.376 |
| 38332.0 | 1.427 |
| 38333.0 | 1.398 |
| 38334.0 | 1.397 |
| 38335.0 | 1.394 |
| 38336.0 | 1.393 |
| 38337.0 | 1.392 |
| 38338.0 | 1.39 |
| 38339.0 | 1.389 |
| 38340.0 | 1.387 |
| 38341.0 | 1.385 |
| 38342.0 | 1.384 |
| 38343.0 | 1.382 |
| 38344.0 | 1.379 |
| 38345.0 | 1.392 |
| 38346.0 | 1.401 |
| 38347.0 | 1.436 |
| 38348.0 | 1.415 |
| 38349.0 | 1.399 |
| 38350.0 | 1.397 |
| 38351.0 | 1.396 |
| 38352.0 | 1.393 |
| 38353.0 | 1.391 |
| 38354.0 | 1.389 |
| 38355.0 | 1.386 |
| 38356.0 | 1.384 |
| 38357.0 | 1.381 |
| 38358.0 | 1.379 |
| 38359.0 | 1.376 |
| 38360.0 | 1.374 |
| 38361.0 | 1.373 |
| 38362.0 | 1.37 |
| 38363.0 | 1.368 |
| 38364.0 | 1.366 |
| 38365.0 | 1.364 |
| 38366.0 | 1.361 |
| 38367.0 | 1.451 |
| 38368.0 | 1.399 |
| 38369.0 | 1.397 |
| 38370.0 | 1.396 |
| 38371.0 | 1.394 |
| 38372.0 | 1.393 |
| 38373.0 | 1.391 |
| 38374.0 | 1.388 |
| 38375.0 | 1.402 |
| 38376.0 | 1.401 |
| 38377.0 | 1.399 |
| 38378.0 | 1.397 |
| 38379.0 | 1.394 |
| 38380.0 | 1.392 |
| 38381.0 | 1.391 |
| 38382.0 | 1.415 |
| 38383.0 | 1.404 |
| 38384.0 | 1.401 |
| 38385.0 | 1.399 |
| 38386.0 | 1.417 |
| 38387.0 | 1.403 |
| 38388.0 | 1.4 |
| 38389.0 | 1.397 |
| 38390.0 | 1.394 |
| 38391.0 | 1.392 |
| 38392.0 | 1.388 |
| 38393.0 | 1.385 |
| 38394.0 | 1.397 |
| 38395.0 | 1.395 |
| 38396.0 | 1.392 |
| 38397.0 | 1.389 |
| 38398.0 | 1.388 |
| 38399.0 | 1.385 |
| 38400.0 | 1.382 |
| 38401.0 | 1.379 |
| 38402.0 | 1.377 |
| 38403.0 | 1.374 |
| 38404.0 | 1.371 |
| 38405.0 | 1.368 |
| 38406.0 | 1.365 |
| 38407.0 | 1.367 |
| 38408.0 | 1.367 |
| 38409.0 | 1.385 |
| 38410.0 | 1.383 |
| 38411.0 | 1.465 |
| 38412.0 | 1.397 |
| 38413.0 | 1.394 |
| 38414.0 | 1.392 |
| 38415.0 | 1.402 |
| 38416.0 | 1.398 |
| 38417.0 | 1.394 |
| 38418.0 | 1.391 |
| 38419.0 | 1.386 |
| 38420.0 | 1.44 |
| 38421.0 | 1.399 |
| 38422.0 | 1.396 |
| 38423.0 | 1.392 |
| 38424.0 | 1.388 |
| 38425.0 | 1.385 |
| 38426.0 | 1.382 |
| 38427.0 | 1.39 |
| 38428.0 | 1.434 |
| 38429.0 | 1.404 |
| 38430.0 | 1.401 |
| 38431.0 | 1.397 |
| 38432.0 | 1.393 |
| 38433.0 | 1.402 |
| 38434.0 | 1.409 |
| 38435.0 | 1.409 |
| 38436.0 | 1.398 |
| 38437.0 | 1.529 |
| 38438.0 | 1.478 |
| 38439.0 | 1.396 |
| 38440.0 | 1.399 |
| 38441.0 | 1.395 |
| 38442.0 | 1.39 |
| 38443.0 | 1.399 |
| 38444.0 | 1.49 |
| 38445.0 | 1.415 |
| 38446.0 | 1.397 |
| 38447.0 | 1.391 |
| 38448.0 | 1.386 |
| 38449.0 | 1.381 |
| 38450.0 | 1.475 |
| 38451.0 | 1.397 |
| 38452.0 | 1.393 |
| 38453.0 | 1.388 |
| 38454.0 | 1.383 |
| 38455.0 | 1.393 |
| 38456.0 | 1.389 |
| 38457.0 | 1.386 |
| 38458.0 | 1.382 |
| 38459.0 | 1.382 |
| 38460.0 | 1.377 |
| 38461.0 | 1.372 |
| 38462.0 | 1.367 |
| 38463.0 | 1.362 |
| 38464.0 | 1.356 |
| 38465.0 | 1.351 |
| 38466.0 | 1.351 |
| 38467.0 | 1.347 |
| 38468.0 | 1.342 |
| 38469.0 | 1.381 |
| 38470.0 | 1.376 |
| 38471.0 | 1.371 |
| 38472.0 | 1.366 |
| 38473.0 | 1.381 |
| 38474.0 | 1.381 |
| 38475.0 | 1.377 |
| 38476.0 | 1.371 |
| 38477.0 | 1.431 |
| 38478.0 | 1.481 |
| 38479.0 | 1.396 |
| 38480.0 | 1.391 |
| 38481.0 | 1.385 |
| 38482.0 | 1.38 |
| 38483.0 | 1.374 |
| 38484.0 | 1.371 |
| 38485.0 | 1.365 |
| 38486.0 | 1.359 |
| 38487.0 | 1.354 |
| 38488.0 | 1.348 |
| 38489.0 | 1.342 |
| 38490.0 | 1.337 |
| 38491.0 | 1.332 |
| 38492.0 | 1.326 |
| 38493.0 | 1.321 |
| 38494.0 | 1.38 |
| 38495.0 | 1.375 |
| 38496.0 | 1.369 |
| 38497.0 | 1.364 |
| 38498.0 | 1.359 |
| 38499.0 | 1.353 |
| 38500.0 | 1.347 |
| 38501.0 | 1.341 |
| 38502.0 | 1.335 |
| 38503.0 | 1.33 |
| 38504.0 | 1.432 |
| 38505.0 | 1.398 |
| 38506.0 | 1.402 |
| 38507.0 | 1.51 |
| 38508.0 | 1.397 |
| 38509.0 | 1.391 |
| 38510.0 | 1.387 |
| 38511.0 | 1.381 |
| 38512.0 | 1.376 |
| 38513.0 | 1.372 |
| 38514.0 | 1.375 |
| 38515.0 | 1.421 |
| 38516.0 | 1.398 |
| 38517.0 | 1.406 |
| 38518.0 | 1.455 |
| 38519.0 | 1.395 |
| 38520.0 | 1.396 |
| 38521.0 | 1.391 |
| 38522.0 | 1.418 |
| 38523.0 | 1.395 |
| 38524.0 | 1.389 |
| 38525.0 | 1.384 |
| 38526.0 | 1.378 |
| 38527.0 | 1.372 |
| 38528.0 | 1.371 |
| 38529.0 | 1.367 |
| 38530.0 | 1.362 |
| 38531.0 | 1.5 |
| 38532.0 | 1.406 |
| 38533.0 | 1.495 |
| 38534.0 | 1.41 |
| 38535.0 | 1.408 |
| 38536.0 | 1.416 |
| 38537.0 | 1.482 |
| 38538.0 | 1.396 |
| 38539.0 | 1.39 |
| 38540.0 | 1.384 |
| 38541.0 | 1.379 |
| 38542.0 | 1.373 |
| 38543.0 | 1.409 |
| 38544.0 | 1.511 |
| 38545.0 | 1.474 |
| 38546.0 | 1.395 |
| 38547.0 | 1.391 |
| 38548.0 | 1.386 |
| 38549.0 | 1.381 |
| 38550.0 | 1.375 |
| 38551.0 | 1.373 |
| 38552.0 | 1.367 |
| 38553.0 | 1.362 |
| 38554.0 | 1.356 |
| 38555.0 | 1.35 |
| 38556.0 | 1.344 |
| 38557.0 | 1.348 |
| 38558.0 | 1.346 |
| 38559.0 | 1.34 |
| 38560.0 | 1.334 |
| 38561.0 | 1.328 |
| 38562.0 | 1.323 |
| 38563.0 | 1.327 |
| 38564.0 | 1.322 |
| 38565.0 | 1.327 |
| 38566.0 | 1.322 |
| 38567.0 | 1.317 |
| 38568.0 | 1.312 |
| 38569.0 | 1.309 |
| 38570.0 | 1.381 |
| 38571.0 | 1.381 |
| 38572.0 | 1.384 |
| 38573.0 | 1.397 |
| 38574.0 | 1.392 |
| 38575.0 | 1.388 |
| 38576.0 | 1.383 |
| 38577.0 | 1.382 |
| 38578.0 | 1.377 |
| 38579.0 | 1.428 |
| 38580.0 | 1.395 |
| 38581.0 | 1.389 |
| 38582.0 | 1.383 |
| 38583.0 | 1.378 |
| 38584.0 | 1.372 |
| 38585.0 | 1.373 |
| 38586.0 | 1.367 |
| 38587.0 | 1.478 |
| 38588.0 | 1.434 |
| 38589.0 | 1.395 |
| 38590.0 | 1.39 |
| 38591.0 | 1.386 |
| 38592.0 | 1.382 |
| 38593.0 | 1.377 |
| 38594.0 | 1.372 |
| 38595.0 | 1.369 |
| 38596.0 | 1.365 |
| 38597.0 | 1.361 |
| 38598.0 | 1.356 |
| 38599.0 | 1.352 |
| 38600.0 | 1.348 |
| 38601.0 | 1.344 |
| 38602.0 | 1.341 |
| 38603.0 | 1.338 |
| 38604.0 | 1.335 |
| 38605.0 | 1.33 |
| 38606.0 | 1.326 |
| 38607.0 | 1.321 |
| 38608.0 | 1.316 |
| 38609.0 | 1.311 |
| 38610.0 | 1.307 |
| 38611.0 | 1.302 |
| 38612.0 | 1.293 |
| 38613.0 | 1.283 |
| 38614.0 | 1.273 |
| 38615.0 | 1.264 |
| 38616.0 | 1.255 |
| 38617.0 | 1.249 |
| 38618.0 | 1.241 |
| 38619.0 | 1.233 |
| 38620.0 | 1.224 |
| 38621.0 | 1.215 |
| 38622.0 | 1.205 |
| 38623.0 | 1.195 |
| 38624.0 | 1.186 |
| 38625.0 | 1.177 |
| 38626.0 | 1.167 |
| 38627.0 | 1.158 |
| 38628.0 | 1.246 |
| 38629.0 | 1.262 |
| 38630.0 | 1.315 |
| 38631.0 | 1.363 |
| 38632.0 | 1.551 |
| 38633.0 | 1.429 |
| 38634.0 | 1.4 |
| 38635.0 | 1.397 |
| 38636.0 | 1.393 |
| 38637.0 | 1.391 |
| 38638.0 | 1.388 |
| 38639.0 | 1.385 |
| 38640.0 | 1.382 |
| 38641.0 | 1.378 |
| 38642.0 | 1.374 |
| 38643.0 | 1.371 |
| 38644.0 | 1.367 |
| 38645.0 | 1.363 |
| 38646.0 | 1.359 |
| 38647.0 | 1.379 |
| 38648.0 | 1.381 |
| 38649.0 | 1.439 |
| 38650.0 | 1.402 |
| 38651.0 | 1.403 |
| 38652.0 | 1.399 |
| 38653.0 | 1.396 |
| 38654.0 | 1.393 |
| 38655.0 | 1.39 |
| 38656.0 | 1.387 |
| 38657.0 | 1.384 |
| 38658.0 | 1.38 |
| 38659.0 | 1.378 |
| 38660.0 | 1.375 |
| 38661.0 | 1.372 |
| 38662.0 | 1.369 |
| 38663.0 | 1.366 |
| 38664.0 | 1.363 |
| 38665.0 | 1.36 |
| 38666.0 | 1.357 |
| 38667.0 | 1.354 |
| 38668.0 | 1.351 |
| 38669.0 | 1.348 |
| 38670.0 | 1.345 |
| 38671.0 | 1.342 |
| 38672.0 | 1.339 |
| 38673.0 | 1.336 |
| 38674.0 | 1.334 |
| 38675.0 | 1.332 |
| 38676.0 | 1.329 |
| 38677.0 | 1.327 |
| 38678.0 | 1.331 |
| 38679.0 | 1.329 |
| 38680.0 | 1.327 |
| 38681.0 | 1.324 |
| 38682.0 | 1.322 |
| 38683.0 | 1.319 |
| 38684.0 | 1.316 |
| 38685.0 | 1.315 |
| 38686.0 | 1.339 |
| 38687.0 | 1.337 |
| 38688.0 | 1.334 |
| 38689.0 | 1.333 |
| 38690.0 | 1.33 |
| 38691.0 | 1.328 |
| 38692.0 | 1.396 |
| 38693.0 | 1.395 |
| 38694.0 | 1.417 |
| 38695.0 | 1.587 |
| 38696.0 | 1.436 |
| 38697.0 | 1.398 |
| 38698.0 | 1.396 |
| 38699.0 | 1.395 |
| 38700.0 | 1.393 |
| 38701.0 | 1.391 |
| 38702.0 | 1.435 |
| 38703.0 | 1.398 |
| 38704.0 | 1.509 |
| 38705.0 | 1.511 |
| 38706.0 | 1.404 |
| 38707.0 | 1.4 |
| 38708.0 | 1.399 |
| 38709.0 | 1.397 |
| 38710.0 | 1.395 |
| 38711.0 | 1.393 |
| 38712.0 | 1.452 |
| 38713.0 | 1.398 |
| 38714.0 | 1.397 |
| 38715.0 | 1.396 |
| 38716.0 | 1.394 |
| 38717.0 | 1.391 |
| 38718.0 | 1.389 |
| 38719.0 | 1.391 |
| 38720.0 | 1.555 |
| 38721.0 | 1.399 |
| 38722.0 | 1.397 |
| 38723.0 | 1.394 |
| 38724.0 | 1.393 |
| 38725.0 | 1.391 |
| 38726.0 | 1.389 |
| 38727.0 | 1.387 |
| 38728.0 | 1.384 |
| 38729.0 | 1.382 |
| 38730.0 | 1.379 |
| 38731.0 | 1.399 |
| 38732.0 | 1.397 |
| 38733.0 | 1.395 |
| 38734.0 | 1.393 |
| 38735.0 | 1.395 |
| 38736.0 | 1.401 |
| 38737.0 | 1.398 |
| 38738.0 | 1.396 |
| 38739.0 | 1.393 |
| 38740.0 | 1.391 |
| 38741.0 | 1.392 |
| 38742.0 | 1.389 |
| 38743.0 | 1.387 |
| 38744.0 | 1.385 |
| 38745.0 | 1.383 |
| 38746.0 | 1.381 |
| 38747.0 | 1.426 |
| 38748.0 | 1.428 |
| 38749.0 | 1.41 |
| 38750.0 | 1.4 |
| 38751.0 | 1.396 |
| 38752.0 | 1.394 |
| 38753.0 | 1.491 |
| 38754.0 | 1.398 |
| 38755.0 | 1.395 |
| 38756.0 | 1.403 |
| 38757.0 | 1.4 |
| 38758.0 | 1.397 |
| 38759.0 | 1.395 |
| 38760.0 | 1.419 |
| 38761.0 | 1.398 |
| 38762.0 | 1.397 |
| 38763.0 | 1.394 |
| 38764.0 | 1.391 |
| 38765.0 | 1.388 |
| 38766.0 | 1.385 |
| 38767.0 | 1.381 |
| 38768.0 | 1.379 |
| 38769.0 | 1.376 |
| 38770.0 | 1.377 |
| 38771.0 | 1.374 |
| 38772.0 | 1.44 |
| 38773.0 | 1.397 |
| 38774.0 | 1.394 |
| 38775.0 | 1.58 |
| 38776.0 | 1.397 |
| 38777.0 | 1.394 |
| 38778.0 | 1.39 |
| 38779.0 | 1.386 |
| 38780.0 | 1.382 |
| 38781.0 | 1.379 |
| 38782.0 | 1.375 |
| 38783.0 | 1.371 |
| 38784.0 | 1.367 |
| 38785.0 | 1.364 |
| 38786.0 | 1.359 |
| 38787.0 | 1.355 |
| 38788.0 | 1.351 |
| 38789.0 | 1.347 |
| 38790.0 | 1.343 |
| 38791.0 | 1.386 |
| 38792.0 | 1.383 |
| 38793.0 | 1.379 |
| 38794.0 | 1.375 |
| 38795.0 | 1.371 |
| 38796.0 | 1.367 |
| 38797.0 | 1.363 |
| 38798.0 | 1.483 |
| 38799.0 | 1.396 |
| 38800.0 | 1.399 |
| 38801.0 | 1.396 |
| 38802.0 | 1.393 |
| 38803.0 | 1.39 |
| 38804.0 | 1.386 |
| 38805.0 | 1.382 |
| 38806.0 | 1.378 |
| 38807.0 | 1.374 |
| 38808.0 | 1.369 |
| 38809.0 | 1.364 |
| 38810.0 | 1.359 |
| 38811.0 | 1.354 |
| 38812.0 | 1.349 |
| 38813.0 | 1.344 |
| 38814.0 | 1.338 |
| 38815.0 | 1.332 |
| 38816.0 | 1.448 |
| 38817.0 | 1.396 |
| 38818.0 | 1.392 |
| 38819.0 | 1.387 |
| 38820.0 | 1.382 |
| 38821.0 | 1.377 |
| 38822.0 | 1.372 |
| 38823.0 | 1.366 |
| 38824.0 | 1.362 |
| 38825.0 | 1.357 |
| 38826.0 | 1.353 |
| 38827.0 | 1.348 |
| 38828.0 | 1.342 |
| 38829.0 | 1.423 |
| 38830.0 | 1.406 |
| 38831.0 | 1.397 |
| 38832.0 | 1.392 |
| 38833.0 | 1.387 |
| 38834.0 | 1.407 |
| 38835.0 | 1.401 |
| 38836.0 | 1.396 |
| 38837.0 | 1.391 |
| 38838.0 | 1.387 |
| 38839.0 | 1.382 |
| 38840.0 | 1.376 |
| 38841.0 | 1.369 |
| 38842.0 | 1.363 |
| 38843.0 | 1.358 |
| 38844.0 | 1.362 |
| 38845.0 | 1.357 |
| 38846.0 | 1.371 |
| 38847.0 | 1.373 |
| 38848.0 | 1.367 |
| 38849.0 | 1.373 |
| 38850.0 | 1.368 |
| 38851.0 | 1.362 |
| 38852.0 | 1.356 |
| 38853.0 | 1.351 |
| 38854.0 | 1.347 |
| 38855.0 | 1.341 |
| 38856.0 | 1.335 |
| 38857.0 | 1.33 |
| 38858.0 | 1.324 |
| 38859.0 | 1.318 |
| 38860.0 | 1.311 |
| 38861.0 | 1.305 |
| 38862.0 | 1.298 |
| 38863.0 | 1.286 |
| 38864.0 | 1.273 |
| 38865.0 | 1.261 |
| 38866.0 | 1.248 |
| 38867.0 | 1.236 |
| 38868.0 | 1.223 |
| 38869.0 | 1.211 |
| 38870.0 | 1.2 |
| 38871.0 | 1.298 |
| 38872.0 | 1.341 |
| 38873.0 | 1.335 |
| 38874.0 | 1.329 |
| 38875.0 | 1.323 |
| 38876.0 | 1.317 |
| 38877.0 | 1.31 |
| 38878.0 | 1.303 |
| 38879.0 | 1.295 |
| 38880.0 | 1.284 |
| 38881.0 | 1.373 |
| 38882.0 | 1.515 |
| 38883.0 | 1.395 |
| 38884.0 | 1.39 |
| 38885.0 | 1.384 |
| 38886.0 | 1.379 |
| 38887.0 | 1.373 |
| 38888.0 | 1.37 |
| 38889.0 | 1.364 |
| 38890.0 | 1.357 |
| 38891.0 | 1.351 |
| 38892.0 | 1.344 |
| 38893.0 | 1.338 |
| 38894.0 | 1.333 |
| 38895.0 | 1.328 |
| 38896.0 | 1.389 |
| 38897.0 | 1.384 |
| 38898.0 | 1.378 |
| 38899.0 | 1.372 |
| 38900.0 | 1.365 |
| 38901.0 | 1.359 |
| 38902.0 | 1.353 |
| 38903.0 | 1.346 |
| 38904.0 | 1.34 |
| 38905.0 | 1.338 |
| 38906.0 | 1.338 |
| 38907.0 | 1.332 |
| 38908.0 | 1.326 |
| 38909.0 | 1.319 |
| 38910.0 | 1.313 |
| 38911.0 | 1.309 |
| 38912.0 | 1.303 |
| 38913.0 | 1.293 |
| 38914.0 | 1.28 |
| 38915.0 | 1.267 |
| 38916.0 | 1.269 |
| 38917.0 | 1.256 |
| 38918.0 | 1.243 |
| 38919.0 | 1.23 |
| 38920.0 | 1.218 |
| 38921.0 | 1.322 |
| 38922.0 | 1.351 |
| 38923.0 | 1.35 |
| 38924.0 | 1.372 |
| 38925.0 | 1.367 |
| 38926.0 | 1.36 |
| 38927.0 | 1.354 |
| 38928.0 | 1.353 |
| 38929.0 | 1.353 |
| 38930.0 | 1.358 |
| 38931.0 | 1.352 |
| 38932.0 | 1.346 |
| 38933.0 | 1.341 |
| 38934.0 | 1.337 |
| 38935.0 | 1.331 |
| 38936.0 | 1.326 |
| 38937.0 | 1.319 |
| 38938.0 | 1.339 |
| 38939.0 | 1.342 |
| 38940.0 | 1.336 |
| 38941.0 | 1.331 |
| 38942.0 | 1.325 |
| 38943.0 | 1.32 |
| 38944.0 | 1.316 |
| 38945.0 | 1.311 |
| 38946.0 | 1.306 |
| 38947.0 | 1.3 |
| 38948.0 | 1.308 |
| 38949.0 | 1.303 |
| 38950.0 | 1.296 |
| 38951.0 | 1.29 |
| 38952.0 | 1.28 |
| 38953.0 | 1.364 |
| 38954.0 | 1.37 |
| 38955.0 | 1.424 |
| 38956.0 | 1.395 |
| 38957.0 | 1.403 |
| 38958.0 | 1.397 |
| 38959.0 | 1.391 |
| 38960.0 | 1.388 |
| 38961.0 | 1.383 |
| 38962.0 | 1.379 |
| 38963.0 | 1.374 |
| 38964.0 | 1.369 |
| 38965.0 | 1.364 |
| 38966.0 | 1.359 |
| 38967.0 | 1.355 |
| 38968.0 | 1.387 |
| 38969.0 | 1.384 |
| 38970.0 | 1.383 |
| 38971.0 | 1.379 |
| 38972.0 | 1.375 |
| 38973.0 | 1.371 |
| 38974.0 | 1.377 |
| 38975.0 | 1.374 |
| 38976.0 | 1.37 |
| 38977.0 | 1.365 |
| 38978.0 | 1.36 |
| 38979.0 | 1.38 |
| 38980.0 | 1.448 |
| 38981.0 | 1.395 |
| 38982.0 | 1.39 |
| 38983.0 | 1.385 |
| 38984.0 | 1.38 |
| 38985.0 | 1.375 |
| 38986.0 | 1.37 |
| 38987.0 | 1.365 |
| 38988.0 | 1.36 |
| 38989.0 | 1.355 |
| 38990.0 | 1.351 |
| 38991.0 | 1.345 |
| 38992.0 | 1.34 |
| 38993.0 | 1.336 |
| 38994.0 | 1.332 |
| 38995.0 | 1.328 |
| 38996.0 | 1.324 |
| 38997.0 | 1.32 |
| 38998.0 | 1.316 |
| 38999.0 | 1.313 |
| 39000.0 | 1.309 |
| 39001.0 | 1.305 |
| 39002.0 | 1.301 |
| 39003.0 | 1.295 |
| 39004.0 | 1.286 |
| 39005.0 | 1.279 |
| 39006.0 | 1.271 |
| 39007.0 | 1.263 |
| 39008.0 | 1.257 |
| 39009.0 | 1.256 |
| 39010.0 | 1.32 |
| 39011.0 | 1.316 |
| 39012.0 | 1.313 |
| 39013.0 | 1.309 |
| 39014.0 | 1.305 |
| 39015.0 | 1.302 |
| 39016.0 | 1.297 |
| 39017.0 | 1.291 |
| 39018.0 | 1.401 |
| 39019.0 | 1.424 |
| 39020.0 | 1.397 |
| 39021.0 | 1.393 |
| 39022.0 | 1.389 |
| 39023.0 | 1.385 |
| 39024.0 | 1.382 |
| 39025.0 | 1.38 |
| 39026.0 | 1.377 |
| 39027.0 | 1.376 |
| 39028.0 | 1.373 |
| 39029.0 | 1.395 |
| 39030.0 | 1.393 |
| 39031.0 | 1.39 |
| 39032.0 | 1.387 |
| 39033.0 | 1.384 |
| 39034.0 | 1.382 |
| 39035.0 | 1.38 |
| 39036.0 | 1.377 |
| 39037.0 | 1.382 |
| 39038.0 | 1.382 |
| 39039.0 | 1.38 |
| 39040.0 | 1.378 |
| 39041.0 | 1.376 |
| 39042.0 | 1.374 |
| 39043.0 | 1.373 |
| 39044.0 | 1.373 |
| 39045.0 | 1.37 |
| 39046.0 | 1.368 |
| 39047.0 | 1.365 |
| 39048.0 | 1.362 |
| 39049.0 | 1.36 |
| 39050.0 | 1.357 |
| 39051.0 | 1.36 |
| 39052.0 | 1.368 |
| 39053.0 | 1.379 |
| 39054.0 | 1.38 |
| 39055.0 | 1.379 |
| 39056.0 | 1.377 |
| 39057.0 | 1.375 |
| 39058.0 | 1.372 |
| 39059.0 | 1.372 |
| 39060.0 | 1.371 |
| 39061.0 | 1.369 |
| 39062.0 | 1.367 |
| 39063.0 | 1.365 |
| 39064.0 | 1.362 |
| 39065.0 | 1.36 |
| 39066.0 | 1.358 |
| 39067.0 | 1.356 |
| 39068.0 | 1.354 |
| 39069.0 | 1.351 |
| 39070.0 | 1.349 |
| 39071.0 | 1.346 |
| 39072.0 | 1.344 |
| 39073.0 | 1.342 |
| 39074.0 | 1.405 |
| 39075.0 | 1.417 |
| 39076.0 | 1.406 |
| 39077.0 | 1.536 |
| 39078.0 | 1.399 |
| 39079.0 | 1.397 |
| 39080.0 | 1.395 |
| 39081.0 | 1.393 |
| 39082.0 | 1.39 |
| 39083.0 | 1.388 |
| 39084.0 | 1.497 |
| 39085.0 | 1.4 |
| 39086.0 | 1.429 |
| 39087.0 | 1.398 |
| 39088.0 | 1.428 |
| 39089.0 | 1.398 |
| 39090.0 | 1.395 |
| 39091.0 | 1.403 |
| 39092.0 | 1.4 |
| 39093.0 | 1.399 |
| 39094.0 | 1.396 |
| 39095.0 | 1.394 |
| 39096.0 | 1.391 |
| 39097.0 | 1.389 |
| 39098.0 | 1.386 |
| 39099.0 | 1.384 |
| 39100.0 | 1.383 |
| 39101.0 | 1.382 |
| 39102.0 | 1.38 |
| 39103.0 | 1.378 |
| 39104.0 | 1.375 |
| 39105.0 | 1.379 |
| 39106.0 | 1.378 |
| 39107.0 | 1.385 |
| 39108.0 | 1.411 |
| 39109.0 | 1.4 |
| 39110.0 | 1.401 |
| 39111.0 | 1.417 |
| 39112.0 | 1.399 |
| 39113.0 | 1.397 |
| 39114.0 | 1.395 |
| 39115.0 | 1.494 |
| 39116.0 | 1.406 |
| 39117.0 | 1.401 |
| 39118.0 | 1.399 |
| 39119.0 | 1.397 |
| 39120.0 | 1.395 |
| 39121.0 | 1.391 |
| 39122.0 | 1.389 |
| 39123.0 | 1.386 |
| 39124.0 | 1.383 |
| 39125.0 | 1.38 |
| 39126.0 | 1.378 |
| 39127.0 | 1.374 |
| 39128.0 | 1.371 |
| 39129.0 | 1.369 |
| 39130.0 | 1.367 |
| 39131.0 | 1.365 |
| 39132.0 | 1.373 |
| 39133.0 | 1.371 |
| 39134.0 | 1.367 |
| 39135.0 | 1.364 |
| 39136.0 | 1.361 |
| 39137.0 | 1.358 |
| 39138.0 | 1.354 |
| 39139.0 | 1.351 |
| 39140.0 | 1.348 |
| 39141.0 | 1.35 |
| 39142.0 | 1.347 |
| 39143.0 | 1.344 |
| 39144.0 | 1.403 |
| 39145.0 | 1.4 |
| 39146.0 | 1.397 |
| 39147.0 | 1.394 |
| 39148.0 | 1.39 |
| 39149.0 | 1.386 |
| 39150.0 | 1.382 |
| 39151.0 | 1.402 |
| 39152.0 | 1.397 |
| 39153.0 | 1.393 |
| 39154.0 | 1.388 |
| 39155.0 | 1.384 |
| 39156.0 | 1.38 |
| 39157.0 | 1.376 |
| 39158.0 | 1.392 |
| 39159.0 | 1.389 |
| 39160.0 | 1.386 |
| 39161.0 | 1.382 |
| 39162.0 | 1.377 |
| 39163.0 | 1.373 |
| 39164.0 | 1.369 |
| 39165.0 | 1.364 |
| 39166.0 | 1.36 |
| 39167.0 | 1.355 |
| 39168.0 | 1.35 |
| 39169.0 | 1.346 |
| 39170.0 | 1.342 |
| 39171.0 | 1.337 |
| 39172.0 | 1.335 |
| 39173.0 | 1.332 |
| 39174.0 | 1.327 |
| 39175.0 | 1.322 |
| 39176.0 | 1.316 |
| 39177.0 | 1.311 |
| 39178.0 | 1.324 |
| 39179.0 | 1.32 |
| 39180.0 | 1.317 |
| 39181.0 | 1.313 |
| 39182.0 | 1.316 |
| 39183.0 | 1.314 |
| 39184.0 | 1.308 |
| 39185.0 | 1.303 |
| 39186.0 | 1.293 |
| 39187.0 | 1.282 |
| 39188.0 | 1.298 |
| 39189.0 | 1.289 |
| 39190.0 | 1.278 |
| 39191.0 | 1.298 |
| 39192.0 | 1.289 |
| 39193.0 | 1.281 |
| 39194.0 | 1.271 |
| 39195.0 | 1.261 |
| 39196.0 | 1.249 |
| 39197.0 | 1.238 |
| 39198.0 | 1.227 |
| 39199.0 | 1.216 |
| 39200.0 | 1.261 |
| 39201.0 | 1.251 |
| 39202.0 | 1.24 |
| 39203.0 | 1.228 |
| 39204.0 | 1.215 |
| 39205.0 | 1.234 |
| 39206.0 | 1.221 |
| 39207.0 | 1.246 |
| 39208.0 | 1.282 |
| 39209.0 | 1.271 |
| 39210.0 | 1.261 |
| 39211.0 | 1.251 |
| 39212.0 | 1.241 |
| 39213.0 | 1.231 |
| 39214.0 | 1.219 |
| 39215.0 | 1.206 |
| 39216.0 | 1.339 |
| 39217.0 | 1.335 |
| 39218.0 | 1.329 |
| 39219.0 | 1.323 |
| 39220.0 | 1.339 |
| 39221.0 | 1.335 |
| 39222.0 | 1.33 |
| 39223.0 | 1.323 |
| 39224.0 | 1.317 |
| 39225.0 | 1.311 |
| 39226.0 | 1.305 |
| 39227.0 | 1.304 |
| 39228.0 | 1.299 |
| 39229.0 | 1.288 |
| 39230.0 | 1.276 |
| 39231.0 | 1.264 |
| 39232.0 | 1.251 |
| 39233.0 | 1.239 |
| 39234.0 | 1.228 |
| 39235.0 | 1.223 |
| 39236.0 | 1.467 |
| 39237.0 | 1.395 |
| 39238.0 | 1.39 |
| 39239.0 | 1.385 |
| 39240.0 | 1.38 |
| 39241.0 | 1.431 |
| 39242.0 | 1.393 |
| 39243.0 | 1.424 |
| 39244.0 | 1.393 |
| 39245.0 | 1.387 |
| 39246.0 | 1.396 |
| 39247.0 | 1.396 |
| 39248.0 | 1.392 |
| 39249.0 | 1.385 |
| 39250.0 | 1.379 |
| 39251.0 | 1.372 |
| 39252.0 | 1.365 |
| 39253.0 | 1.36 |
| 39254.0 | 1.474 |
| 39255.0 | 1.399 |
| 39256.0 | 1.394 |
| 39257.0 | 1.387 |
| 39258.0 | 1.424 |
| 39259.0 | 1.395 |
| 39260.0 | 1.392 |
| 39261.0 | 1.387 |
| 39262.0 | 1.412 |
| 39263.0 | 1.396 |
| 39264.0 | 1.39 |
| 39265.0 | 1.388 |
| 39266.0 | 1.396 |
| 39267.0 | 1.394 |
| 39268.0 | 1.391 |
| 39269.0 | 1.389 |
| 39270.0 | 1.382 |
| 39271.0 | 1.376 |
| 39272.0 | 1.371 |
| 39273.0 | 1.365 |
| 39274.0 | 1.359 |
| 39275.0 | 1.359 |
| 39276.0 | 1.359 |
| 39277.0 | 1.354 |
| 39278.0 | 1.371 |
| 39279.0 | 1.379 |
| 39280.0 | 1.375 |
| 39281.0 | 1.378 |
| 39282.0 | 1.371 |
| 39283.0 | 1.365 |
| 39284.0 | 1.359 |
| 39285.0 | 1.357 |
| 39286.0 | 1.359 |
| 39287.0 | 1.353 |
| 39288.0 | 1.355 |
| 39289.0 | 1.367 |
| 39290.0 | 1.361 |
| 39291.0 | 1.355 |
| 39292.0 | 1.511 |
| 39293.0 | 1.395 |
| 39294.0 | 1.39 |
| 39295.0 | 1.428 |
| 39296.0 | 1.395 |
| 39297.0 | 1.433 |
| 39298.0 | 1.458 |
| 39299.0 | 1.397 |
| 39300.0 | 1.391 |
| 39301.0 | 1.386 |
| 39302.0 | 1.38 |
| 39303.0 | 1.374 |
| 39304.0 | 1.369 |
| 39305.0 | 1.37 |
| 39306.0 | 1.365 |
| 39307.0 | 1.368 |
| 39308.0 | 1.364 |
| 39309.0 | 1.374 |
| 39310.0 | 1.393 |
| 39311.0 | 1.388 |
| 39312.0 | 1.382 |
| 39313.0 | 1.377 |
| 39314.0 | 1.371 |
| 39315.0 | 1.365 |
| 39316.0 | 1.359 |
| 39317.0 | 1.353 |
| 39318.0 | 1.347 |
| 39319.0 | 1.345 |
| 39320.0 | 1.36 |
| 39321.0 | 1.365 |
| 39322.0 | 1.384 |
| 39323.0 | 1.38 |
| 39324.0 | 1.374 |
| 39325.0 | 1.451 |
| 39326.0 | 1.41 |
| 39327.0 | 1.424 |
| 39328.0 | 1.398 |
| 39329.0 | 1.394 |
| 39330.0 | 1.389 |
| 39331.0 | 1.384 |
| 39332.0 | 1.379 |
| 39333.0 | 1.374 |
| 39334.0 | 1.371 |
| 39335.0 | 1.366 |
| 39336.0 | 1.361 |
| 39337.0 | 1.357 |
| 39338.0 | 1.352 |
| 39339.0 | 1.368 |
| 39340.0 | 1.412 |
| 39341.0 | 1.42 |
| 39342.0 | 1.396 |
| 39343.0 | 1.394 |
| 39344.0 | 1.391 |
| 39345.0 | 1.426 |
| 39346.0 | 1.448 |
| 39347.0 | 1.456 |
| 39348.0 | 1.396 |
| 39349.0 | 1.402 |
| 39350.0 | 1.397 |
| 39351.0 | 1.399 |
| 39352.0 | 1.427 |
| 39353.0 | 1.395 |
| 39354.0 | 1.391 |
| 39355.0 | 1.387 |
| 39356.0 | 1.387 |
| 39357.0 | 1.389 |
| 39358.0 | 1.465 |
| 39359.0 | 1.399 |
| 39360.0 | 1.413 |
| 39361.0 | 1.446 |
| 39362.0 | 1.423 |
| 39363.0 | 1.407 |
| 39364.0 | 1.399 |
| 39365.0 | 1.395 |
| 39366.0 | 1.392 |
| 39367.0 | 1.387 |
| 39368.0 | 1.384 |
| 39369.0 | 1.38 |
| 39370.0 | 1.377 |
| 39371.0 | 1.373 |
| 39372.0 | 1.37 |
| 39373.0 | 1.367 |
| 39374.0 | 1.363 |
| 39375.0 | 1.359 |
| 39376.0 | 1.356 |
| 39377.0 | 1.359 |
| 39378.0 | 1.359 |
| 39379.0 | 1.356 |
| 39380.0 | 1.363 |
| 39381.0 | 1.36 |
| 39382.0 | 1.363 |
| 39383.0 | 1.361 |
| 39384.0 | 1.366 |
| 39385.0 | 1.37 |
| 39386.0 | 1.367 |
| 39387.0 | 1.364 |
| 39388.0 | 1.361 |
| 39389.0 | 1.359 |
| 39390.0 | 1.356 |
| 39391.0 | 1.354 |
| 39392.0 | 1.351 |
| 39393.0 | 1.348 |
| 39394.0 | 1.346 |
| 39395.0 | 1.343 |
| 39396.0 | 1.341 |
| 39397.0 | 1.338 |
| 39398.0 | 1.335 |
| 39399.0 | 1.333 |
| 39400.0 | 1.33 |
| 39401.0 | 1.327 |
| 39402.0 | 1.325 |
| 39403.0 | 1.323 |
| 39404.0 | 1.32 |
| 39405.0 | 1.317 |
| 39406.0 | 1.315 |
| 39407.0 | 1.312 |
| 39408.0 | 1.309 |
| 39409.0 | 1.347 |
| 39410.0 | 1.345 |
| 39411.0 | 1.342 |
| 39412.0 | 1.34 |
| 39413.0 | 1.337 |
| 39414.0 | 1.335 |
| 39415.0 | 1.333 |
| 39416.0 | 1.331 |
| 39417.0 | 1.329 |
| 39418.0 | 1.327 |
| 39419.0 | 1.324 |
| 39420.0 | 1.321 |
| 39421.0 | 1.319 |
| 39422.0 | 1.317 |
| 39423.0 | 1.314 |
| 39424.0 | 1.312 |
| 39425.0 | 1.31 |
| 39426.0 | 1.307 |
| 39427.0 | 1.305 |
| 39428.0 | 1.302 |
| 39429.0 | 1.3 |
| 39430.0 | 1.294 |
| 39431.0 | 1.289 |
| 39432.0 | 1.284 |
| 39433.0 | 1.371 |
| 39434.0 | 1.37 |
| 39435.0 | 1.368 |
| 39436.0 | 1.366 |
| 39437.0 | 1.363 |
| 39438.0 | 1.376 |
| 39439.0 | 1.374 |
| 39440.0 | 1.373 |
| 39441.0 | 1.371 |
| 39442.0 | 1.369 |
| 39443.0 | 1.368 |
| 39444.0 | 1.366 |
| 39445.0 | 1.363 |
| 39446.0 | 1.361 |
| 39447.0 | 1.359 |
| 39448.0 | 1.366 |
| 39449.0 | 1.364 |
| 39450.0 | 1.363 |
| 39451.0 | 1.362 |
| 39452.0 | 1.36 |
| 39453.0 | 1.357 |
| 39454.0 | 1.355 |
| 39455.0 | 1.352 |
| 39456.0 | 1.35 |
| 39457.0 | 1.347 |
| 39458.0 | 1.344 |
| 39459.0 | 1.354 |
| 39460.0 | 1.374 |
| 39461.0 | 1.372 |
| 39462.0 | 1.37 |
| 39463.0 | 1.369 |
| 39464.0 | 1.385 |
| 39465.0 | 1.408 |
| 39466.0 | 1.402 |
| 39467.0 | 1.485 |
| 39468.0 | 1.399 |
| 39469.0 | 1.397 |
| 39470.0 | 1.408 |
| 39471.0 | 1.404 |
| 39472.0 | 1.4 |
| 39473.0 | 1.399 |
| 39474.0 | 1.407 |
| 39475.0 | 1.401 |
| 39476.0 | 1.398 |
| 39477.0 | 1.396 |
| 39478.0 | 1.404 |
| 39479.0 | 1.4 |
| 39480.0 | 1.396 |
| 39481.0 | 1.393 |
| 39482.0 | 1.389 |
| 39483.0 | 1.386 |
| 39484.0 | 1.382 |
| 39485.0 | 1.379 |
| 39486.0 | 1.397 |
| 39487.0 | 1.395 |
| 39488.0 | 1.392 |
| 39489.0 | 1.389 |
| 39490.0 | 1.386 |
| 39491.0 | 1.384 |
| 39492.0 | 1.386 |
| 39493.0 | 1.388 |
| 39494.0 | 1.39 |
| 39495.0 | 1.392 |
| 39496.0 | 1.394 |
| 39497.0 | 1.396 |
| 39498.0 | 1.394 |
| 39499.0 | 1.391 |
| 39500.0 | 1.4 |
| 39501.0 | 1.486 |
| 39502.0 | 1.435 |
| 39503.0 | 1.397 |
| 39504.0 | 1.394 |
| 39505.0 | 1.442 |
| 39506.0 | 1.399 |
| 39507.0 | 1.396 |
| 39508.0 | 1.393 |
| 39509.0 | 1.389 |
| 39510.0 | 1.385 |
| 39511.0 | 1.38 |
| 39512.0 | 1.401 |
| 39513.0 | 1.398 |
| 39514.0 | 1.401 |
| 39515.0 | 1.593 |
| 39516.0 | 1.396 |
| 39517.0 | 1.393 |
| 39518.0 | 1.389 |
| 39519.0 | 1.386 |
| 39520.0 | 1.383 |
| 39521.0 | 1.378 |
| 39522.0 | 1.379 |
| 39523.0 | 1.375 |
| 39524.0 | 1.37 |
| 39525.0 | 1.366 |
| 39526.0 | 1.361 |
| 39527.0 | 1.357 |
| 39528.0 | 1.363 |
| 39529.0 | 1.358 |
| 39530.0 | 1.354 |
| 39531.0 | 1.35 |
| 39532.0 | 1.347 |
| 39533.0 | 1.343 |
| 39534.0 | 1.339 |
| 39535.0 | 1.334 |
| 39536.0 | 1.329 |
| 39537.0 | 1.324 |
| 39538.0 | 1.322 |
| 39539.0 | 1.317 |
| 39540.0 | 1.315 |
| 39541.0 | 1.349 |
| 39542.0 | 1.383 |
| 39543.0 | 1.417 |
| 39544.0 | 1.434 |
| 39545.0 | 1.425 |
| 39546.0 | 1.396 |
| 39547.0 | 1.392 |
| 39548.0 | 1.388 |
| 39549.0 | 1.382 |
| 39550.0 | 1.377 |
| 39551.0 | 1.371 |
| 39552.0 | 1.378 |
| 39553.0 | 1.374 |
| 39554.0 | 1.371 |
| 39555.0 | 1.366 |
| 39556.0 | 1.36 |
| 39557.0 | 1.354 |
| 39558.0 | 1.35 |
| 39559.0 | 1.344 |
| 39560.0 | 1.339 |
| 39561.0 | 1.333 |
| 39562.0 | 1.328 |
| 39563.0 | 1.323 |
| 39564.0 | 1.318 |
| 39565.0 | 1.312 |
| 39566.0 | 1.307 |
| 39567.0 | 1.352 |
| 39568.0 | 1.347 |
| 39569.0 | 1.341 |
| 39570.0 | 1.334 |
| 39571.0 | 1.328 |
| 39572.0 | 1.322 |
| 39573.0 | 1.316 |
| 39574.0 | 1.31 |
| 39575.0 | 1.303 |
| 39576.0 | 1.295 |
| 39577.0 | 1.284 |
| 39578.0 | 1.275 |
| 39579.0 | 1.265 |
| 39580.0 | 1.256 |
| 39581.0 | 1.244 |
| 39582.0 | 1.231 |
| 39583.0 | 1.218 |
| 39584.0 | 1.205 |
| 39585.0 | 1.236 |
| 39586.0 | 1.225 |
| 39587.0 | 1.223 |
| 39588.0 | 1.212 |
| 39589.0 | 1.199 |
| 39590.0 | 1.188 |
| 39591.0 | 1.18 |
| 39592.0 | 1.175 |
| 39593.0 | 1.164 |
| 39594.0 | 1.153 |
| 39595.0 | 1.141 |
| 39596.0 | 1.129 |
| 39597.0 | 1.116 |
| 39598.0 | 1.103 |
| 39599.0 | 1.09 |
| 39600.0 | 1.075 |
| 39601.0 | 1.104 |
| 39602.0 | 1.091 |
| 39603.0 | 1.079 |
| 39604.0 | 1.064 |
| 39605.0 | 1.05 |
| 39606.0 | 1.036 |
| 39607.0 | 1.021 |
| 39608.0 | 1.006 |
| 39609.0 | 1.023 |
| 39610.0 | 1.067 |
| 39611.0 | 1.083 |
| 39612.0 | 1.185 |
| 39613.0 | 1.175 |
| 39614.0 | 1.498 |
| 39615.0 | 1.42 |
| 39616.0 | 1.395 |
| 39617.0 | 1.388 |
| 39618.0 | 1.383 |
| 39619.0 | 1.377 |
| 39620.0 | 1.37 |
| 39621.0 | 1.377 |
| 39622.0 | 1.382 |
| 39623.0 | 1.386 |
| 39624.0 | 1.379 |
| 39625.0 | 1.374 |
| 39626.0 | 1.374 |
| 39627.0 | 1.414 |
| 39628.0 | 1.397 |
| 39629.0 | 1.409 |
| 39630.0 | 1.453 |
| 39631.0 | 1.395 |
| 39632.0 | 1.389 |
| 39633.0 | 1.383 |
| 39634.0 | 1.376 |
| 39635.0 | 1.37 |
| 39636.0 | 1.365 |
| 39637.0 | 1.372 |
| 39638.0 | 1.599 |
| 39639.0 | 1.394 |
| 39640.0 | 1.388 |
| 39641.0 | 1.382 |
| 39642.0 | 1.49 |
| 39643.0 | 1.395 |
| 39644.0 | 1.393 |
| 39645.0 | 1.408 |
| 39646.0 | 1.397 |
| 39647.0 | 1.473 |
| 39648.0 | 1.395 |
| 39649.0 | 1.389 |
| 39650.0 | 1.383 |
| 39651.0 | 1.377 |
| 39652.0 | 1.371 |
| 39653.0 | 1.379 |
| 39654.0 | 1.373 |
| 39655.0 | 1.367 |
| 39656.0 | 1.433 |
| 39657.0 | 1.395 |
| 39658.0 | 1.394 |
| 39659.0 | 1.399 |
| 39660.0 | 1.466 |
| 39661.0 | 1.403 |
| 39662.0 | 1.443 |
| 39663.0 | 1.398 |
| 39664.0 | 1.393 |
| 39665.0 | 1.388 |
| 39666.0 | 1.381 |
| 39667.0 | 1.375 |
| 39668.0 | 1.37 |
| 39669.0 | 1.365 |
| 39670.0 | 1.359 |
| 39671.0 | 1.353 |
| 39672.0 | 1.349 |
| 39673.0 | 1.412 |
| 39674.0 | 1.431 |
| 39675.0 | 1.423 |
| 39676.0 | 1.402 |
| 39677.0 | 1.399 |
| 39678.0 | 1.399 |
| 39679.0 | 1.395 |
| 39680.0 | 1.414 |
| 39681.0 | 1.399 |
| 39682.0 | 1.55 |
| 39683.0 | 1.585 |
| 39684.0 | 1.451 |
| 39685.0 | 1.439 |
| 39686.0 | 1.395 |
| 39687.0 | 1.39 |
| 39688.0 | 1.385 |
| 39689.0 | 1.379 |
| 39690.0 | 1.373 |
| 39691.0 | 1.375 |
| 39692.0 | 1.371 |
| 39693.0 | 1.367 |
| 39694.0 | 1.364 |
| 39695.0 | 1.36 |
| 39696.0 | 1.355 |
| 39697.0 | 1.351 |
| 39698.0 | 1.346 |
| 39699.0 | 1.341 |
| 39700.0 | 1.335 |
| 39701.0 | 1.331 |
| 39702.0 | 1.338 |
| 39703.0 | 1.337 |
| 39704.0 | 1.333 |
| 39705.0 | 1.328 |
| 39706.0 | 1.324 |
| 39707.0 | 1.342 |
| 39708.0 | 1.338 |
| 39709.0 | 1.348 |
| 39710.0 | 1.344 |
| 39711.0 | 1.339 |
| 39712.0 | 1.337 |
| 39713.0 | 1.377 |
| 39714.0 | 1.376 |
| 39715.0 | 1.372 |
| 39716.0 | 1.368 |
| 39717.0 | 1.363 |
| 39718.0 | 1.358 |
| 39719.0 | 1.353 |
| 39720.0 | 1.348 |
| 39721.0 | 1.343 |
| 39722.0 | 1.338 |
| 39723.0 | 1.335 |
| 39724.0 | 1.331 |
| 39725.0 | 1.327 |
| 39726.0 | 1.323 |
| 39727.0 | 1.322 |
| 39728.0 | 1.318 |
| 39729.0 | 1.315 |
| 39730.0 | 1.319 |
| 39731.0 | 1.433 |
| 39732.0 | 1.397 |
| 39733.0 | 1.394 |
| 39734.0 | 1.39 |
| 39735.0 | 1.396 |
| 39736.0 | 1.394 |
| 39737.0 | 1.39 |
| 39738.0 | 1.387 |
| 39739.0 | 1.383 |
| 39740.0 | 1.379 |
| 39741.0 | 1.376 |
| 39742.0 | 1.373 |
| 39743.0 | 1.37 |
| 39744.0 | 1.366 |
| 39745.0 | 1.366 |
| 39746.0 | 1.415 |
| 39747.0 | 1.399 |
| 39748.0 | 1.396 |
| 39749.0 | 1.392 |
| 39750.0 | 1.39 |
| 39751.0 | 1.387 |
| 39752.0 | 1.383 |
| 39753.0 | 1.38 |
| 39754.0 | 1.378 |
| 39755.0 | 1.375 |
| 39756.0 | 1.373 |
| 39757.0 | 1.371 |
| 39758.0 | 1.37 |
| 39759.0 | 1.367 |
| 39760.0 | 1.364 |
| 39761.0 | 1.361 |
| 39762.0 | 1.359 |
| 39763.0 | 1.356 |
| 39764.0 | 1.353 |
| 39765.0 | 1.35 |
| 39766.0 | 1.348 |
| 39767.0 | 1.348 |
| 39768.0 | 1.383 |
| 39769.0 | 1.382 |
| 39770.0 | 1.379 |
| 39771.0 | 1.377 |
| 39772.0 | 1.375 |
| 39773.0 | 1.374 |
| 39774.0 | 1.372 |
| 39775.0 | 1.37 |
| 39776.0 | 1.368 |
| 39777.0 | 1.365 |
| 39778.0 | 1.363 |
| 39779.0 | 1.361 |
| 39780.0 | 1.358 |
| 39781.0 | 1.355 |
| 39782.0 | 1.352 |
| 39783.0 | 1.46 |
| 39784.0 | 1.398 |
| 39785.0 | 1.402 |
| 39786.0 | 1.399 |
| 39787.0 | 1.397 |
| 39788.0 | 1.395 |
| 39789.0 | 1.394 |
| 39790.0 | 1.392 |
| 39791.0 | 1.39 |
| 39792.0 | 1.387 |
| 39793.0 | 1.385 |
| 39794.0 | 1.435 |
| 39795.0 | 1.398 |
| 39796.0 | 1.396 |
| 39797.0 | 1.394 |
| 39798.0 | 1.392 |
| 39799.0 | 1.39 |
| 39800.0 | 1.387 |
| 39801.0 | 1.385 |
| 39802.0 | 1.382 |
| 39803.0 | 1.38 |
| 39804.0 | 1.377 |
| 39805.0 | 1.376 |
| 39806.0 | 1.373 |
| 39807.0 | 1.371 |
| 39808.0 | 1.368 |
| 39809.0 | 1.366 |
| 39810.0 | 1.364 |
| 39811.0 | 1.361 |
| 39812.0 | 1.359 |
| 39813.0 | 1.356 |
| 39814.0 | 1.354 |
| 39815.0 | 1.352 |
| 39816.0 | 1.349 |
| 39817.0 | 1.347 |
| 39818.0 | 1.344 |
| 39819.0 | 1.342 |
| 39820.0 | 1.339 |
| 39821.0 | 1.342 |
| 39822.0 | 1.34 |
| 39823.0 | 1.337 |
| 39824.0 | 1.334 |
| 39825.0 | 1.335 |
| 39826.0 | 1.337 |
| 39827.0 | 1.409 |
| 39828.0 | 1.401 |
| 39829.0 | 1.4 |
| 39830.0 | 1.398 |
| 39831.0 | 1.397 |
| 39832.0 | 1.395 |
| 39833.0 | 1.394 |
| 39834.0 | 1.393 |
| 39835.0 | 1.391 |
| 39836.0 | 1.389 |
| 39837.0 | 1.387 |
| 39838.0 | 1.384 |
| 39839.0 | 1.382 |
| 39840.0 | 1.379 |
| 39841.0 | 1.377 |
| 39842.0 | 1.375 |
| 39843.0 | 1.505 |
| 39844.0 | 1.4 |
| 39845.0 | 1.398 |
| 39846.0 | 1.395 |
| 39847.0 | 1.421 |
| 39848.0 | 1.399 |
| 39849.0 | 1.397 |
| 39850.0 | 1.396 |
| 39851.0 | 1.393 |
| 39852.0 | 1.39 |
| 39853.0 | 1.387 |
| 39854.0 | 1.383 |
| 39855.0 | 1.38 |
| 39856.0 | 1.376 |
| 39857.0 | 1.374 |
| 39858.0 | 1.37 |
| 39859.0 | 1.379 |
| 39860.0 | 1.378 |
| 39861.0 | 1.376 |
| 39862.0 | 1.373 |
| 39863.0 | 1.37 |
| 39864.0 | 1.41 |
| 39865.0 | 1.4 |
| 39866.0 | 1.397 |
| 39867.0 | 1.394 |
| 39868.0 | 1.392 |
| 39869.0 | 1.389 |
| 39870.0 | 1.386 |
| 39871.0 | 1.383 |
| 39872.0 | 1.379 |
| 39873.0 | 1.376 |
| 39874.0 | 1.391 |
| 39875.0 | 1.388 |
| 39876.0 | 1.385 |
| 39877.0 | 1.382 |
| 39878.0 | 1.378 |
| 39879.0 | 1.373 |
| 39880.0 | 1.369 |
| 39881.0 | 1.364 |
| 39882.0 | 1.36 |
| 39883.0 | 1.355 |
| 39884.0 | 1.35 |
| 39885.0 | 1.345 |
| 39886.0 | 1.341 |
| 39887.0 | 1.337 |
| 39888.0 | 1.332 |
| 39889.0 | 1.328 |
| 39890.0 | 1.324 |
| 39891.0 | 1.32 |
| 39892.0 | 1.316 |
| 39893.0 | 1.312 |
| 39894.0 | 1.309 |
| 39895.0 | 1.305 |
| 39896.0 | 1.316 |
| 39897.0 | 1.313 |
| 39898.0 | 1.308 |
| 39899.0 | 1.305 |
| 39900.0 | 1.324 |
| 39901.0 | 1.482 |
| 39902.0 | 1.474 |
| 39903.0 | 1.396 |
| 39904.0 | 1.417 |
| 39905.0 | 1.52 |
| 39906.0 | 1.396 |
| 39907.0 | 1.401 |
| 39908.0 | 1.395 |
| 39909.0 | 1.39 |
| 39910.0 | 1.387 |
| 39911.0 | 1.383 |
| 39912.0 | 1.379 |
| 39913.0 | 1.374 |
| 39914.0 | 1.369 |
| 39915.0 | 1.364 |
| 39916.0 | 1.359 |
| 39917.0 | 1.389 |
| 39918.0 | 1.404 |
| 39919.0 | 1.397 |
| 39920.0 | 1.392 |
| 39921.0 | 1.388 |
| 39922.0 | 1.383 |
| 39923.0 | 1.378 |
| 39924.0 | 1.38 |
| 39925.0 | 1.375 |
| 39926.0 | 1.371 |
| 39927.0 | 1.366 |
| 39928.0 | 1.36 |
| 39929.0 | 1.354 |
| 39930.0 | 1.349 |
| 39931.0 | 1.343 |
| 39932.0 | 1.338 |
| 39933.0 | 1.332 |
| 39934.0 | 1.327 |
| 39935.0 | 1.321 |
| 39936.0 | 1.314 |
| 39937.0 | 1.308 |
| 39938.0 | 1.303 |
| 39939.0 | 1.293 |
| 39940.0 | 1.28 |
| 39941.0 | 1.268 |
| 39942.0 | 1.255 |
| 39943.0 | 1.242 |
| 39944.0 | 1.229 |
| 39945.0 | 1.216 |
| 39946.0 | 1.209 |
| 39947.0 | 1.198 |
| 39948.0 | 1.192 |
| 39949.0 | 1.181 |
| 39950.0 | 1.171 |
| 39951.0 | 1.218 |
| 39952.0 | 1.249 |
| 39953.0 | 1.342 |
| 39954.0 | 1.455 |
| 39955.0 | 1.419 |
| 39956.0 | 1.447 |
| 39957.0 | 1.407 |
| 39958.0 | 1.4 |
| 39959.0 | 1.396 |
| 39960.0 | 1.42 |
| 39961.0 | 1.397 |
| 39962.0 | 1.402 |
| 39963.0 | 1.396 |
| 39964.0 | 1.391 |
| 39965.0 | 1.384 |
| 39966.0 | 1.378 |
| 39967.0 | 1.371 |
| 39968.0 | 1.373 |
| 39969.0 | 1.43 |
| 39970.0 | 1.416 |
| 39971.0 | 1.396 |
| 39972.0 | 1.391 |
| 39973.0 | 1.385 |
| 39974.0 | 1.379 |
| 39975.0 | 1.372 |
| 39976.0 | 1.366 |
| 39977.0 | 1.36 |
| 39978.0 | 1.356 |
| 39979.0 | 1.35 |
| 39980.0 | 1.373 |
| 39981.0 | 1.383 |
| 39982.0 | 1.377 |
| 39983.0 | 1.385 |
| 39984.0 | 1.379 |
| 39985.0 | 1.373 |
| 39986.0 | 1.367 |
| 39987.0 | 1.36 |
| 39988.0 | 1.413 |
| 39989.0 | 1.395 |
| 39990.0 | 1.388 |
| 39991.0 | 1.382 |
| 39992.0 | 1.378 |
| 39993.0 | 1.372 |
| 39994.0 | 1.4 |
| 39995.0 | 1.438 |
| 39996.0 | 1.394 |
| 39997.0 | 1.388 |
| 39998.0 | 1.392 |
| 39999.0 | 1.386 |
| 40000.0 | 1.38 |
| 40001.0 | 1.41 |
| 40002.0 | 1.505 |
| 40003.0 | 1.456 |
| 40004.0 | 1.404 |
| 40005.0 | 1.399 |
| 40006.0 | 1.394 |
| 40007.0 | 1.429 |
| 40008.0 | 1.396 |
| 40009.0 | 1.391 |
| 40010.0 | 1.385 |
| 40011.0 | 1.414 |
| 40012.0 | 1.398 |
| 40013.0 | 1.406 |
| 40014.0 | 1.404 |
| 40015.0 | 1.397 |
| 40016.0 | 1.39 |
| 40017.0 | 1.394 |
| 40018.0 | 1.388 |
| 40019.0 | 1.395 |
| 40020.0 | 1.4 |
| 40021.0 | 1.395 |
| 40022.0 | 1.389 |
| 40023.0 | 1.383 |
| 40024.0 | 1.384 |
| 40025.0 | 1.38 |
| 40026.0 | 1.425 |
| 40027.0 | 1.406 |
| 40028.0 | 1.397 |
| 40029.0 | 1.399 |
| 40030.0 | 1.394 |
| 40031.0 | 1.655 |
| 40032.0 | 1.525 |
| 40033.0 | 1.394 |
| 40034.0 | 1.389 |
| 40035.0 | 1.383 |
| 40036.0 | 1.377 |
| 40037.0 | 1.371 |
| 40038.0 | 1.366 |
| 40039.0 | 1.373 |
| 40040.0 | 1.372 |
| 40041.0 | 1.367 |
| 40042.0 | 1.385 |
| 40043.0 | 1.383 |
| 40044.0 | 1.379 |
| 40045.0 | 1.373 |
| 40046.0 | 1.368 |
| 40047.0 | 1.363 |
| 40048.0 | 1.36 |
| 40049.0 | 1.355 |
| 40050.0 | 1.349 |
| 40051.0 | 1.343 |
| 40052.0 | 1.376 |
| 40053.0 | 1.48 |
| 40054.0 | 1.401 |
| 40055.0 | 1.396 |
| 40056.0 | 1.39 |
| 40057.0 | 1.385 |
| 40058.0 | 1.382 |
| 40059.0 | 1.383 |
| 40060.0 | 1.379 |
| 40061.0 | 1.374 |
| 40062.0 | 1.372 |
| 40063.0 | 1.369 |
| 40064.0 | 1.364 |
| 40065.0 | 1.359 |
| 40066.0 | 1.354 |
| 40067.0 | 1.349 |
| 40068.0 | 1.345 |
| 40069.0 | 1.401 |
| 40070.0 | 1.413 |
| 40071.0 | 1.397 |
| 40072.0 | 1.393 |
| 40073.0 | 1.388 |
| 40074.0 | 1.529 |
| 40075.0 | 1.397 |
| 40076.0 | 1.392 |
| 40077.0 | 1.387 |
| 40078.0 | 1.388 |
| 40079.0 | 1.383 |
| 40080.0 | 1.379 |
| 40081.0 | 1.382 |
| 40082.0 | 1.378 |
| 40083.0 | 1.373 |
| 40084.0 | 1.368 |
| 40085.0 | 1.363 |
| 40086.0 | 1.369 |
| 40087.0 | 1.365 |
| 40088.0 | 1.36 |
| 40089.0 | 1.356 |
| 40090.0 | 1.352 |
| 40091.0 | 1.348 |
| 40092.0 | 1.411 |
| 40093.0 | 1.399 |
| 40094.0 | 1.397 |
| 40095.0 | 1.393 |
| 40096.0 | 1.39 |
| 40097.0 | 1.386 |
| 40098.0 | 1.382 |
| 40099.0 | 1.378 |
| 40100.0 | 1.376 |
| 40101.0 | 1.375 |
| 40102.0 | 1.39 |
| 40103.0 | 1.396 |
| 40104.0 | 1.394 |
| 40105.0 | 1.391 |
| 40106.0 | 1.388 |
| 40107.0 | 1.384 |
| 40108.0 | 1.381 |
| 40109.0 | 1.377 |
| 40110.0 | 1.373 |
| 40111.0 | 1.369 |
| 40112.0 | 1.366 |
| 40113.0 | 1.362 |
| 40114.0 | 1.393 |
| 40115.0 | 1.389 |
| 40116.0 | 1.386 |
| 40117.0 | 1.383 |
| 40118.0 | 1.379 |
| 40119.0 | 1.376 |
| 40120.0 | 1.373 |
| 40121.0 | 1.371 |
| 40122.0 | 1.368 |
| 40123.0 | 1.365 |
| 40124.0 | 1.362 |
| 40125.0 | 1.359 |
| 40126.0 | 1.356 |
| 40127.0 | 1.353 |
| 40128.0 | 1.361 |
| 40129.0 | 1.383 |
| 40130.0 | 1.381 |
| 40131.0 | 1.379 |
| 40132.0 | 1.376 |
| 40133.0 | 1.373 |
| 40134.0 | 1.37 |
| 40135.0 | 1.367 |
| 40136.0 | 1.364 |
| 40137.0 | 1.361 |
| 40138.0 | 1.359 |
| 40139.0 | 1.356 |
| 40140.0 | 1.378 |
| 40141.0 | 1.375 |
| 40142.0 | 1.378 |
| 40143.0 | 1.405 |
| 40144.0 | 1.4 |
| 40145.0 | 1.398 |
| 40146.0 | 1.396 |
| 40147.0 | 1.393 |
| 40148.0 | 1.39 |
| 40149.0 | 1.389 |
| 40150.0 | 1.444 |
| 40151.0 | 1.398 |
| 40152.0 | 1.432 |
| 40153.0 | 1.443 |
| 40154.0 | 1.398 |
| 40155.0 | 1.396 |
| 40156.0 | 1.395 |
| 40157.0 | 1.395 |
| 40158.0 | 1.393 |
| 40159.0 | 1.392 |
| 40160.0 | 1.418 |
| 40161.0 | 1.398 |
| 40162.0 | 1.396 |
| 40163.0 | 1.393 |
| 40164.0 | 1.392 |
| 40165.0 | 1.39 |
| 40166.0 | 1.408 |
| 40167.0 | 1.401 |
| 40168.0 | 1.399 |
| 40169.0 | 1.398 |
| 40170.0 | 1.396 |
| 40171.0 | 1.394 |
| 40172.0 | 1.391 |
| 40173.0 | 1.403 |
| 40174.0 | 1.4 |
| 40175.0 | 1.399 |
| 40176.0 | 1.397 |
| 40177.0 | 1.396 |
| 40178.0 | 1.393 |